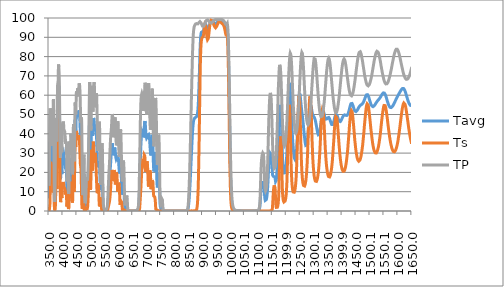
| Category | Tavg | Ts | TP |
|---|---|---|---|
| 349.97 | 6.508 | 0 | 13.017 |
| 350.48 | 7.138 | 0.281 | 13.996 |
| 350.99 | 8.348 | 0.704 | 15.993 |
| 351.5 | 11.121 | 1.271 | 20.971 |
| 352.01 | 15.952 | 1.981 | 29.922 |
| 352.52 | 21.013 | 2.339 | 39.686 |
| 353.02 | 25.55 | 3.533 | 47.568 |
| 353.53 | 28.588 | 5.73 | 51.445 |
| 354.03 | 31.69 | 10.231 | 53.149 |
| 354.53 | 34.672 | 16.026 | 53.319 |
| 355.03 | 37.337 | 21.53 | 53.144 |
| 355.53 | 38.534 | 24.613 | 52.455 |
| 356.03 | 38.877 | 25.484 | 52.27 |
| 356.52 | 38.861 | 25.096 | 52.626 |
| 357.01 | 38.297 | 24.131 | 52.464 |
| 357.51 | 37.366 | 23.074 | 51.659 |
| 358.0 | 36.44 | 22.473 | 50.407 |
| 358.49 | 36.015 | 22.051 | 49.979 |
| 358.97 | 35.868 | 21.639 | 50.097 |
| 359.46 | 35.305 | 21.469 | 49.14 |
| 360.06 | 34.316 | 21.231 | 47.402 |
| 360.55 | 33.411 | 20.657 | 46.166 |
| 361.03 | 32.139 | 18.641 | 45.638 |
| 361.5 | 30.64 | 16.918 | 44.363 |
| 361.98 | 28.518 | 16.063 | 40.974 |
| 362.46 | 25.698 | 14.973 | 36.422 |
| 363.05 | 23.272 | 12.804 | 33.741 |
| 363.52 | 22.8 | 10.703 | 34.896 |
| 363.98 | 24.614 | 9.629 | 39.599 |
| 364.45 | 28.708 | 10.771 | 46.645 |
| 365.03 | 35.099 | 15.515 | 54.682 |
| 365.49 | 38.7 | 19.523 | 57.877 |
| 365.95 | 40.673 | 23.02 | 58.326 |
| 366.53 | 37.827 | 24.28 | 51.374 |
| 366.98 | 32.644 | 22.482 | 42.805 |
| 367.55 | 23.535 | 17.049 | 30.021 |
| 368.0 | 15.774 | 11.325 | 20.223 |
| 368.45 | 9.382 | 6.094 | 12.67 |
| 369.01 | 4.67 | 2.235 | 7.105 |
| 369.46 | 3.136 | 0.983 | 5.289 |
| 370.01 | 2.611 | 0.494 | 4.729 |
| 370.45 | 3.063 | 0.416 | 5.71 |
| 371.0 | 4.799 | 0.5 | 9.098 |
| 371.55 | 7.767 | 0.708 | 14.826 |
| 371.98 | 11.037 | 1.046 | 21.027 |
| 372.52 | 15.996 | 2.142 | 29.85 |
| 372.95 | 20.868 | 3.953 | 37.784 |
| 373.49 | 26.051 | 7.657 | 44.446 |
| 374.02 | 30.572 | 12.899 | 48.244 |
| 374.45 | 33.033 | 17.435 | 48.63 |
| 374.98 | 34.636 | 22.276 | 46.995 |
| 375.51 | 35.04 | 25.512 | 44.568 |
| 376.03 | 34.054 | 25.836 | 42.272 |
| 376.45 | 32.212 | 24.401 | 40.023 |
| 376.97 | 28.771 | 20.393 | 37.15 |
| 377.49 | 26.297 | 16.509 | 36.085 |
| 378.01 | 25.082 | 12.85 | 37.315 |
| 378.52 | 26.862 | 11.456 | 42.268 |
| 379.04 | 31.488 | 13.143 | 49.832 |
| 379.55 | 38.29 | 18.842 | 57.738 |
| 379.96 | 43.447 | 24.793 | 62.102 |
| 380.47 | 48.479 | 31.792 | 65.165 |
| 380.97 | 50.638 | 36.034 | 65.242 |
| 381.48 | 50.559 | 36.362 | 64.756 |
| 381.98 | 49.795 | 34.659 | 64.932 |
| 382.49 | 51.043 | 34.611 | 67.474 |
| 382.99 | 54.492 | 37.959 | 71.025 |
| 383.49 | 59.359 | 44.237 | 74.482 |
| 383.99 | 63.072 | 50.211 | 75.934 |
| 384.49 | 64.781 | 53.875 | 75.688 |
| 384.99 | 64.628 | 54.685 | 74.571 |
| 385.49 | 63.221 | 53.453 | 72.99 |
| 385.99 | 61.23 | 50.685 | 71.775 |
| 386.49 | 58.222 | 47.448 | 68.995 |
| 386.99 | 54.426 | 43.436 | 65.415 |
| 387.49 | 49.053 | 38.412 | 59.693 |
| 387.99 | 42.751 | 32.78 | 52.721 |
| 388.48 | 36.399 | 26.929 | 45.869 |
| 388.98 | 30.156 | 21.098 | 39.213 |
| 389.48 | 24.708 | 15.742 | 33.674 |
| 389.98 | 20.244 | 10.985 | 29.503 |
| 390.49 | 17.511 | 7.511 | 27.51 |
| 390.99 | 16.471 | 5.385 | 27.556 |
| 391.49 | 17.283 | 4.591 | 29.976 |
| 392.0 | 19.792 | 5.303 | 34.28 |
| 392.5 | 23.035 | 7.026 | 39.044 |
| 393.01 | 25.983 | 9.446 | 42.521 |
| 393.51 | 27.441 | 11.484 | 43.398 |
| 394.02 | 26.772 | 12.354 | 41.19 |
| 394.54 | 24.255 | 11.539 | 36.97 |
| 395.05 | 21.097 | 9.524 | 32.671 |
| 395.46 | 19.127 | 7.798 | 30.456 |
| 395.97 | 18.718 | 6.777 | 30.659 |
| 396.49 | 20.389 | 7.366 | 33.413 |
| 397.01 | 23.42 | 9.457 | 37.383 |
| 397.53 | 26.696 | 11.852 | 41.54 |
| 397.95 | 28.683 | 13.584 | 43.782 |
| 398.48 | 30.106 | 14.869 | 45.343 |
| 399.01 | 30.251 | 14.861 | 45.64 |
| 399.54 | 30.055 | 14.618 | 45.492 |
| 399.96 | 30.076 | 14.3 | 45.852 |
| 400.5 | 30.494 | 14.638 | 46.35 |
| 401.04 | 30.859 | 15.026 | 46.692 |
| 401.47 | 30.737 | 15.01 | 46.463 |
| 402.01 | 29.947 | 14.688 | 45.206 |
| 402.45 | 28.903 | 13.759 | 44.046 |
| 402.99 | 27.509 | 12.69 | 42.328 |
| 403.54 | 27.003 | 12.182 | 41.824 |
| 403.99 | 27.001 | 12.16 | 41.841 |
| 404.54 | 27.313 | 12.404 | 42.221 |
| 404.99 | 27.502 | 12.643 | 42.361 |
| 405.55 | 27.157 | 12.442 | 41.873 |
| 406.0 | 26.679 | 12.167 | 41.19 |
| 406.45 | 25.993 | 11.589 | 40.396 |
| 407.02 | 25.31 | 11.157 | 39.464 |
| 407.48 | 24.861 | 10.815 | 38.908 |
| 408.05 | 24.204 | 10.383 | 38.025 |
| 408.51 | 23.577 | 9.924 | 37.23 |
| 408.97 | 22.618 | 9.19 | 36.046 |
| 409.55 | 21.588 | 8.477 | 34.699 |
| 410.02 | 21.372 | 8.537 | 34.207 |
| 410.49 | 21.787 | 8.92 | 34.653 |
| 410.96 | 22.36 | 9.341 | 35.38 |
| 411.55 | 22.659 | 9.385 | 35.932 |
| 412.03 | 21.864 | 8.682 | 35.045 |
| 412.5 | 19.845 | 7.229 | 32.462 |
| 412.98 | 16.875 | 5.405 | 28.345 |
| 413.46 | 13.44 | 3.547 | 23.333 |
| 413.94 | 10.506 | 2.301 | 18.712 |
| 414.55 | 8.702 | 2.042 | 15.361 |
| 415.04 | 9.065 | 2.787 | 15.343 |
| 415.52 | 11.103 | 4.16 | 18.046 |
| 416.01 | 13.82 | 5.439 | 22.202 |
| 416.5 | 16.264 | 6.399 | 26.128 |
| 417.0 | 17.646 | 6.801 | 28.491 |
| 417.49 | 17.426 | 6.32 | 28.531 |
| 417.99 | 15.387 | 5.033 | 25.742 |
| 418.48 | 12.122 | 3.141 | 21.104 |
| 418.98 | 8.652 | 1.726 | 15.578 |
| 419.48 | 6.04 | 1.026 | 11.054 |
| 419.98 | 4.81 | 0.849 | 8.772 |
| 420.49 | 4.874 | 1.054 | 8.695 |
| 420.99 | 6.35 | 1.837 | 10.864 |
| 421.5 | 9.339 | 3.484 | 15.194 |
| 422.0 | 13.427 | 5.794 | 21.059 |
| 422.51 | 17.84 | 8.077 | 27.603 |
| 423.02 | 21.115 | 9.665 | 32.565 |
| 423.53 | 23.081 | 10.673 | 35.489 |
| 424.04 | 23.196 | 10.334 | 36.058 |
| 424.55 | 21.393 | 8.944 | 33.842 |
| 425.06 | 19.125 | 7.389 | 30.86 |
| 425.45 | 17.902 | 6.78 | 29.023 |
| 425.96 | 18.204 | 7.577 | 28.832 |
| 426.48 | 20.36 | 9.659 | 31.061 |
| 426.99 | 23.318 | 12.091 | 34.545 |
| 427.51 | 25.948 | 14.058 | 37.838 |
| 428.03 | 27.493 | 15.136 | 39.85 |
| 428.54 | 27.563 | 15.001 | 40.124 |
| 429.06 | 26.138 | 13.664 | 38.611 |
| 429.45 | 24.42 | 12.165 | 36.674 |
| 429.97 | 21.975 | 10.119 | 33.831 |
| 430.49 | 19.954 | 8.602 | 31.306 |
| 431.01 | 18.46 | 7.583 | 29.338 |
| 431.52 | 17.193 | 6.777 | 27.609 |
| 432.04 | 15.881 | 6.007 | 25.754 |
| 432.56 | 14.417 | 5.269 | 23.566 |
| 432.95 | 13.335 | 4.758 | 21.912 |
| 433.47 | 12.192 | 4.345 | 20.04 |
| 433.99 | 11.666 | 4.34 | 18.992 |
| 434.51 | 12.405 | 5.312 | 19.499 |
| 435.03 | 15.021 | 7.736 | 22.305 |
| 435.55 | 19.763 | 12.086 | 27.441 |
| 435.94 | 24.21 | 16.176 | 32.245 |
| 436.46 | 29.903 | 21.263 | 38.544 |
| 436.97 | 33.982 | 24.842 | 43.122 |
| 437.49 | 35.636 | 26.281 | 44.991 |
| 438.01 | 34.151 | 24.661 | 43.642 |
| 438.52 | 29.853 | 20.436 | 39.269 |
| 439.04 | 24.227 | 15.142 | 33.312 |
| 439.55 | 19.689 | 11.252 | 28.125 |
| 439.94 | 17.887 | 9.991 | 25.783 |
| 440.45 | 18.289 | 10.744 | 25.833 |
| 440.96 | 21.544 | 13.905 | 29.182 |
| 441.48 | 27.016 | 19.04 | 34.992 |
| 441.99 | 33.68 | 25.215 | 42.144 |
| 442.5 | 40.116 | 31.254 | 48.978 |
| 443.0 | 44.874 | 35.865 | 53.882 |
| 443.51 | 47.363 | 38.493 | 56.232 |
| 444.02 | 47.32 | 38.503 | 56.137 |
| 444.52 | 45.301 | 36.698 | 53.904 |
| 445.03 | 42.904 | 34.44 | 51.369 |
| 445.53 | 41.645 | 33.226 | 50.063 |
| 446.03 | 42.4 | 33.812 | 50.987 |
| 446.53 | 44.687 | 35.793 | 53.581 |
| 447.03 | 47.624 | 38.133 | 57.115 |
| 447.52 | 50.162 | 40.172 | 60.151 |
| 448.02 | 51.757 | 41.483 | 62.032 |
| 448.51 | 52.067 | 41.596 | 62.537 |
| 449.0 | 51.364 | 40.979 | 61.749 |
| 449.49 | 50.057 | 39.78 | 60.333 |
| 449.98 | 49.083 | 38.875 | 59.29 |
| 450.47 | 48.584 | 38.16 | 59.008 |
| 450.96 | 48.764 | 37.966 | 59.561 |
| 451.56 | 49.637 | 37.974 | 61.299 |
| 452.04 | 50.334 | 37.983 | 62.685 |
| 452.52 | 50.799 | 37.939 | 63.659 |
| 453.0 | 50.852 | 37.759 | 63.945 |
| 453.48 | 50.516 | 37.572 | 63.459 |
| 453.95 | 50.182 | 37.675 | 62.689 |
| 454.54 | 49.767 | 37.93 | 61.605 |
| 455.01 | 49.773 | 38.327 | 61.219 |
| 455.48 | 50.177 | 38.818 | 61.537 |
| 456.06 | 50.901 | 39.281 | 62.522 |
| 456.52 | 51.52 | 39.39 | 63.65 |
| 456.99 | 51.981 | 39.24 | 64.721 |
| 457.45 | 52.223 | 38.841 | 65.605 |
| 458.02 | 52.072 | 37.996 | 66.148 |
| 458.47 | 51.638 | 37.065 | 66.212 |
| 459.04 | 50.581 | 35.486 | 65.675 |
| 459.49 | 49.499 | 33.998 | 64.999 |
| 460.05 | 47.822 | 31.828 | 63.817 |
| 460.5 | 46.271 | 29.992 | 62.549 |
| 460.95 | 44.429 | 28.115 | 60.744 |
| 461.5 | 41.974 | 25.918 | 58.031 |
| 462.05 | 39.599 | 24.41 | 54.789 |
| 462.49 | 37.924 | 23.821 | 52.028 |
| 463.04 | 36.122 | 23.405 | 48.838 |
| 463.47 | 34.999 | 23.056 | 46.941 |
| 464.01 | 33.99 | 22.291 | 45.688 |
| 464.55 | 33.356 | 20.695 | 46.018 |
| 464.98 | 32.933 | 18.827 | 47.04 |
| 465.51 | 32.087 | 15.75 | 48.423 |
| 466.04 | 30.357 | 11.941 | 48.773 |
| 466.47 | 28.254 | 8.771 | 47.737 |
| 466.99 | 25.015 | 5.374 | 44.656 |
| 467.52 | 21.25 | 3.138 | 39.363 |
| 468.04 | 17.303 | 1.926 | 32.681 |
| 468.46 | 14.205 | 1.479 | 26.931 |
| 468.97 | 10.594 | 1.116 | 20.072 |
| 469.49 | 7.833 | 1.056 | 14.61 |
| 470.0 | 6.146 | 1.251 | 11.041 |
| 470.52 | 5.508 | 1.94 | 9.076 |
| 471.03 | 5.637 | 3.053 | 8.221 |
| 471.54 | 6.375 | 4.314 | 8.435 |
| 472.04 | 7.581 | 5.285 | 9.877 |
| 472.55 | 9.354 | 5.894 | 12.814 |
| 473.05 | 11.742 | 6.172 | 17.313 |
| 473.46 | 13.693 | 5.973 | 21.414 |
| 473.96 | 15.456 | 5.219 | 25.693 |
| 474.46 | 16.088 | 3.69 | 28.486 |
| 474.96 | 15.62 | 2.039 | 29.201 |
| 475.46 | 14.529 | 0.946 | 28.113 |
| 475.96 | 12.499 | 0.429 | 24.569 |
| 476.46 | 9.758 | 0.289 | 19.228 |
| 477.05 | 6.364 | 0.212 | 12.516 |
| 477.55 | 4.247 | 0.186 | 8.308 |
| 478.05 | 2.984 | 0.161 | 5.808 |
| 478.54 | 2.374 | 0.173 | 4.575 |
| 479.04 | 2.11 | 0.184 | 4.036 |
| 479.54 | 2.06 | 0.208 | 3.911 |
| 480.03 | 2.186 | 0.27 | 4.102 |
| 480.53 | 2.478 | 0.354 | 4.602 |
| 481.03 | 3.001 | 0.51 | 5.492 |
| 481.53 | 3.799 | 0.751 | 6.847 |
| 482.03 | 4.803 | 0.991 | 8.614 |
| 482.52 | 5.981 | 1.253 | 10.708 |
| 483.03 | 7.239 | 1.514 | 12.964 |
| 483.53 | 8.32 | 1.664 | 14.976 |
| 484.03 | 9.16 | 1.705 | 16.615 |
| 484.53 | 9.641 | 1.69 | 17.592 |
| 485.04 | 9.794 | 1.578 | 18.009 |
| 485.55 | 9.572 | 1.408 | 17.736 |
| 486.05 | 9.143 | 1.25 | 17.035 |
| 486.46 | 8.843 | 1.223 | 16.464 |
| 486.97 | 8.641 | 1.313 | 15.968 |
| 487.49 | 8.725 | 1.555 | 15.895 |
| 488.0 | 9.248 | 2.052 | 16.444 |
| 488.52 | 10.24 | 2.859 | 17.62 |
| 489.04 | 11.679 | 4.081 | 19.277 |
| 489.45 | 13.161 | 5.353 | 20.969 |
| 489.97 | 15.298 | 7.154 | 23.442 |
| 490.5 | 17.752 | 9.209 | 26.295 |
| 491.03 | 20.389 | 11.388 | 29.39 |
| 491.45 | 22.742 | 13.281 | 32.203 |
| 491.98 | 26.007 | 15.896 | 36.118 |
| 492.52 | 29.795 | 19.033 | 40.557 |
| 493.05 | 34.212 | 22.561 | 45.862 |
| 493.49 | 37.838 | 25.139 | 50.537 |
| 494.03 | 42.038 | 27.592 | 56.485 |
| 494.46 | 44.764 | 28.762 | 60.765 |
| 495.01 | 46.915 | 28.948 | 64.881 |
| 495.45 | 47.42 | 27.995 | 66.845 |
| 496.0 | 46.247 | 25.44 | 67.054 |
| 496.56 | 43.06 | 21.334 | 64.786 |
| 497.0 | 39.505 | 17.659 | 61.351 |
| 497.45 | 35.693 | 14.281 | 57.104 |
| 498.01 | 31.409 | 11.562 | 51.256 |
| 498.46 | 28.935 | 10.877 | 46.993 |
| 499.03 | 27.52 | 11.808 | 43.231 |
| 499.49 | 27.859 | 13.938 | 41.78 |
| 499.95 | 29.543 | 17.233 | 41.853 |
| 500.52 | 33.25 | 22.235 | 44.265 |
| 500.98 | 36.549 | 25.749 | 47.349 |
| 501.45 | 39.889 | 28.676 | 51.101 |
| 502.03 | 43.689 | 31.084 | 56.294 |
| 502.5 | 45.835 | 31.728 | 59.942 |
| 502.97 | 46.968 | 31.069 | 62.867 |
| 503.56 | 46.704 | 28.58 | 64.828 |
| 504.03 | 45.161 | 25.545 | 64.776 |
| 504.51 | 43.057 | 22.63 | 63.485 |
| 504.99 | 41 | 20.921 | 61.079 |
| 505.47 | 39.517 | 20.869 | 58.164 |
| 505.95 | 38.885 | 22.596 | 55.173 |
| 506.55 | 39.304 | 26.086 | 52.522 |
| 507.04 | 40.412 | 29.326 | 51.498 |
| 507.53 | 41.978 | 32.276 | 51.68 |
| 508.02 | 43.795 | 34.67 | 52.921 |
| 508.51 | 45.541 | 35.948 | 55.134 |
| 509.0 | 47.05 | 36.199 | 57.9 |
| 509.49 | 48.173 | 35.484 | 60.863 |
| 509.99 | 48.534 | 33.488 | 63.58 |
| 510.48 | 48.236 | 30.877 | 65.596 |
| 510.98 | 47.426 | 28.123 | 66.729 |
| 511.48 | 46.487 | 26.148 | 66.825 |
| 511.98 | 45.511 | 25.162 | 65.861 |
| 512.48 | 44.662 | 25.215 | 64.109 |
| 512.99 | 43.877 | 26.025 | 61.73 |
| 513.49 | 43.192 | 27.155 | 59.23 |
| 514.0 | 42.629 | 28.414 | 56.845 |
| 514.5 | 42.192 | 29.405 | 54.979 |
| 515.01 | 41.896 | 30.046 | 53.746 |
| 515.52 | 41.713 | 30.16 | 53.266 |
| 516.03 | 41.643 | 29.739 | 53.546 |
| 516.54 | 41.559 | 28.709 | 54.408 |
| 517.05 | 41.459 | 27.225 | 55.694 |
| 517.56 | 41.336 | 25.394 | 57.278 |
| 517.95 | 41.22 | 23.893 | 58.547 |
| 518.46 | 40.951 | 21.913 | 59.989 |
| 518.97 | 40.452 | 19.852 | 61.051 |
| 519.49 | 39.61 | 17.869 | 61.352 |
| 520.0 | 38.411 | 15.977 | 60.845 |
| 520.52 | 36.762 | 14.118 | 59.405 |
| 521.04 | 34.716 | 12.43 | 57.001 |
| 521.55 | 32.398 | 10.935 | 53.86 |
| 521.94 | 30.596 | 10.011 | 51.182 |
| 522.46 | 28.316 | 9.213 | 47.418 |
| 522.98 | 26.135 | 8.874 | 43.395 |
| 523.49 | 24.414 | 9.122 | 39.707 |
| 524.01 | 23.255 | 10.012 | 36.498 |
| 524.53 | 22.657 | 11.386 | 33.929 |
| 525.05 | 22.411 | 12.714 | 32.108 |
| 525.56 | 22.438 | 13.727 | 31.149 |
| 525.95 | 22.593 | 14.173 | 31.014 |
| 526.47 | 22.946 | 14.335 | 31.556 |
| 526.98 | 23.536 | 13.992 | 33.079 |
| 527.5 | 24.264 | 12.969 | 35.559 |
| 528.02 | 24.845 | 11.188 | 38.502 |
| 528.53 | 25.209 | 8.762 | 41.655 |
| 529.05 | 25.406 | 6.346 | 44.466 |
| 529.56 | 25.272 | 4.258 | 46.287 |
| 529.95 | 24.978 | 3.211 | 46.744 |
| 530.46 | 24.273 | 2.336 | 46.21 |
| 530.98 | 22.93 | 1.928 | 43.933 |
| 531.49 | 21.124 | 1.859 | 40.389 |
| 532.0 | 18.968 | 2.228 | 35.708 |
| 532.51 | 16.887 | 3.171 | 30.602 |
| 533.02 | 15.048 | 4.481 | 25.615 |
| 533.53 | 13.496 | 5.634 | 21.359 |
| 534.04 | 12.194 | 6.377 | 18.012 |
| 534.54 | 11.303 | 6.884 | 15.722 |
| 535.05 | 10.74 | 7.18 | 14.301 |
| 535.55 | 10.451 | 7.292 | 13.609 |
| 536.05 | 10.289 | 6.944 | 13.633 |
| 536.56 | 10.297 | 6.15 | 14.445 |
| 537.06 | 10.356 | 4.548 | 16.163 |
| 537.56 | 10.863 | 2.705 | 19.021 |
| 538.05 | 12.164 | 1.26 | 23.068 |
| 538.55 | 14.014 | 0.523 | 27.506 |
| 539.04 | 15.909 | 0.298 | 31.519 |
| 539.54 | 17.153 | 0.196 | 34.111 |
| 540.03 | 17.61 | 0.139 | 35.08 |
| 540.52 | 17.33 | 0.102 | 34.558 |
| 541.01 | 16.157 | 0.074 | 32.239 |
| 541.49 | 14.364 | 0.056 | 28.672 |
| 541.98 | 11.755 | 0.047 | 23.463 |
| 542.46 | 8.892 | 0.046 | 17.738 |
| 543.06 | 5.561 | 0.037 | 11.085 |
| 543.54 | 3.707 | 0.037 | 7.376 |
| 544.02 | 2.506 | 0.065 | 4.946 |
| 544.5 | 1.75 | 0.028 | 3.472 |
| 544.97 | 1.307 | 0.046 | 2.567 |
| 545.56 | 0.964 | 0.037 | 1.891 |
| 546.03 | 0.771 | 0.037 | 1.505 |
| 546.5 | 0.659 | 0.065 | 1.252 |
| 546.97 | 0.549 | 0.028 | 1.07 |
| 547.55 | 0.467 | 0.037 | 0.896 |
| 548.01 | 0.422 | 0.037 | 0.807 |
| 548.47 | 0.37 | 0.009 | 0.73 |
| 549.04 | 0.338 | 0.019 | 0.657 |
| 549.5 | 0.313 | 0.009 | 0.617 |
| 549.95 | 0.297 | 0.019 | 0.575 |
| 550.51 | 0.29 | 0.028 | 0.552 |
| 550.96 | 0.298 | 0.056 | 0.54 |
| 551.52 | 0.28 | 0.009 | 0.551 |
| 551.97 | 0.284 | 0.028 | 0.54 |
| 552.52 | 0.296 | 0.046 | 0.546 |
| 552.96 | 0.31 | 0.047 | 0.574 |
| 553.51 | 0.314 | 0.037 | 0.592 |
| 553.95 | 0.324 | 0.028 | 0.621 |
| 554.49 | 0.365 | 0.047 | 0.684 |
| 555.03 | 0.402 | 0.056 | 0.747 |
| 555.46 | 0.42 | 0.028 | 0.811 |
| 556.0 | 0.495 | 0.056 | 0.934 |
| 556.53 | 0.571 | 0.065 | 1.076 |
| 556.96 | 0.663 | 0.065 | 1.26 |
| 557.48 | 0.809 | 0.103 | 1.516 |
| 558.01 | 1.012 | 0.14 | 1.883 |
| 558.53 | 1.279 | 0.178 | 2.381 |
| 558.95 | 1.577 | 0.262 | 2.891 |
| 559.47 | 2.079 | 0.403 | 3.756 |
| 559.99 | 2.7 | 0.599 | 4.801 |
| 560.5 | 3.487 | 0.854 | 6.121 |
| 561.02 | 4.444 | 1.174 | 7.715 |
| 561.53 | 5.463 | 1.503 | 9.424 |
| 562.04 | 6.607 | 1.889 | 11.326 |
| 562.55 | 7.728 | 2.271 | 13.185 |
| 563.05 | 8.848 | 2.641 | 15.054 |
| 563.46 | 9.696 | 2.943 | 16.449 |
| 563.96 | 10.687 | 3.281 | 18.093 |
| 564.46 | 11.605 | 3.587 | 19.624 |
| 564.96 | 12.441 | 3.899 | 20.982 |
| 565.46 | 13.241 | 4.165 | 22.318 |
| 565.96 | 14.042 | 4.517 | 23.567 |
| 566.46 | 14.929 | 4.971 | 24.888 |
| 567.05 | 16.128 | 5.584 | 26.671 |
| 567.55 | 17.224 | 6.184 | 28.264 |
| 568.04 | 18.442 | 6.904 | 29.981 |
| 568.54 | 19.714 | 7.677 | 31.751 |
| 569.03 | 21.048 | 8.553 | 33.543 |
| 569.53 | 22.29 | 9.448 | 35.133 |
| 570.02 | 23.53 | 10.521 | 36.54 |
| 570.51 | 24.695 | 11.618 | 37.773 |
| 571.01 | 25.884 | 12.897 | 38.87 |
| 571.5 | 26.992 | 14.222 | 39.762 |
| 572.0 | 28.132 | 15.652 | 40.612 |
| 572.49 | 29.287 | 17.149 | 41.424 |
| 572.99 | 30.454 | 18.562 | 42.346 |
| 573.48 | 31.602 | 19.758 | 43.446 |
| 573.98 | 32.668 | 20.659 | 44.678 |
| 574.48 | 33.593 | 21.21 | 45.976 |
| 574.98 | 34.381 | 21.406 | 47.356 |
| 575.48 | 34.876 | 21.148 | 48.603 |
| 575.98 | 35.084 | 20.593 | 49.575 |
| 576.48 | 34.96 | 19.678 | 50.242 |
| 576.99 | 34.414 | 18.532 | 50.295 |
| 577.49 | 33.592 | 17.358 | 49.825 |
| 578.0 | 32.558 | 16.328 | 48.788 |
| 578.51 | 31.449 | 15.627 | 47.27 |
| 579.02 | 30.39 | 15.349 | 45.431 |
| 579.53 | 29.528 | 15.573 | 43.483 |
| 580.05 | 28.858 | 16.196 | 41.521 |
| 580.46 | 28.566 | 16.959 | 40.173 |
| 580.98 | 28.5 | 18.094 | 38.905 |
| 581.5 | 28.745 | 19.303 | 38.187 |
| 582.03 | 29.188 | 20.266 | 38.11 |
| 582.55 | 29.907 | 21.087 | 38.727 |
| 582.97 | 30.517 | 21.394 | 39.641 |
| 583.5 | 31.343 | 21.448 | 41.237 |
| 584.04 | 32.099 | 21.084 | 43.114 |
| 584.46 | 32.562 | 20.461 | 44.663 |
| 585.0 | 32.896 | 19.343 | 46.449 |
| 585.54 | 32.917 | 17.971 | 47.864 |
| 585.98 | 32.646 | 16.756 | 48.535 |
| 586.52 | 32.026 | 15.337 | 48.716 |
| 586.96 | 31.357 | 14.417 | 48.296 |
| 587.51 | 30.415 | 13.725 | 47.106 |
| 587.95 | 29.621 | 13.648 | 45.594 |
| 588.51 | 28.717 | 14.065 | 43.369 |
| 588.95 | 28.075 | 14.836 | 41.313 |
| 589.52 | 27.463 | 16.159 | 38.768 |
| 589.97 | 27.088 | 17.303 | 36.873 |
| 590.53 | 26.807 | 18.625 | 34.989 |
| 590.99 | 26.684 | 19.373 | 33.995 |
| 591.56 | 26.726 | 19.902 | 33.549 |
| 592.02 | 26.892 | 20.003 | 33.78 |
| 592.48 | 27.138 | 19.709 | 34.566 |
| 593.06 | 27.547 | 18.832 | 36.263 |
| 593.52 | 27.853 | 17.612 | 38.094 |
| 593.99 | 28.112 | 16.111 | 40.112 |
| 594.46 | 28.261 | 14.348 | 42.175 |
| 595.05 | 28.312 | 12.195 | 44.429 |
| 595.52 | 28.286 | 10.756 | 45.816 |
| 596.0 | 28.283 | 9.989 | 46.576 |
| 596.47 | 28.271 | 9.885 | 46.657 |
| 596.95 | 28.262 | 10.453 | 46.07 |
| 597.55 | 28.138 | 11.915 | 44.361 |
| 598.04 | 27.698 | 13.112 | 42.284 |
| 598.52 | 26.86 | 13.99 | 39.73 |
| 599.01 | 25.812 | 14.636 | 36.988 |
| 599.49 | 24.704 | 15.056 | 34.353 |
| 599.98 | 23.502 | 15.127 | 31.877 |
| 600.47 | 22.455 | 14.958 | 29.953 |
| 600.96 | 21.543 | 14.458 | 28.628 |
| 601.46 | 20.702 | 13.41 | 27.995 |
| 601.95 | 19.995 | 11.889 | 28.102 |
| 602.45 | 19.412 | 9.903 | 28.921 |
| 602.95 | 19.038 | 7.571 | 30.504 |
| 603.45 | 19.046 | 5.478 | 32.614 |
| 603.95 | 19.591 | 4.006 | 35.176 |
| 604.45 | 20.471 | 3.203 | 37.739 |
| 604.95 | 21.545 | 3.039 | 40.051 |
| 605.45 | 22.488 | 3.486 | 41.491 |
| 605.96 | 23.248 | 4.107 | 42.389 |
| 606.46 | 23.478 | 4.63 | 42.326 |
| 606.97 | 23.178 | 4.953 | 41.402 |
| 607.48 | 22.372 | 5.174 | 39.57 |
| 607.99 | 21.062 | 5.376 | 36.748 |
| 608.5 | 19.398 | 5.497 | 33.299 |
| 609.01 | 17.503 | 5.525 | 29.48 |
| 609.52 | 15.49 | 5.373 | 25.607 |
| 610.03 | 13.602 | 5.074 | 22.13 |
| 610.54 | 11.912 | 4.516 | 19.307 |
| 611.06 | 10.379 | 3.585 | 17.172 |
| 611.44 | 9.413 | 2.703 | 16.122 |
| 611.95 | 8.461 | 1.591 | 15.331 |
| 612.47 | 8.051 | 0.845 | 15.258 |
| 612.98 | 8.139 | 0.456 | 15.822 |
| 613.5 | 8.751 | 0.293 | 17.209 |
| 614.01 | 9.728 | 0.243 | 19.213 |
| 614.53 | 10.89 | 0.242 | 21.539 |
| 615.04 | 11.992 | 0.295 | 23.688 |
| 615.56 | 12.898 | 0.421 | 25.375 |
| 615.95 | 13.319 | 0.51 | 26.127 |
| 616.46 | 13.567 | 0.571 | 26.563 |
| 616.98 | 13.391 | 0.658 | 26.123 |
| 617.49 | 12.866 | 0.665 | 25.066 |
| 618.01 | 11.821 | 0.689 | 22.953 |
| 618.52 | 10.441 | 0.722 | 20.159 |
| 619.03 | 8.733 | 0.71 | 16.756 |
| 619.55 | 6.861 | 0.698 | 13.023 |
| 620.06 | 5.19 | 0.697 | 9.683 |
| 620.45 | 4.134 | 0.649 | 7.618 |
| 620.96 | 3.039 | 0.482 | 5.596 |
| 621.47 | 2.292 | 0.28 | 4.304 |
| 621.98 | 1.79 | 0.122 | 3.457 |
| 622.49 | 1.487 | 0.044 | 2.93 |
| 623.0 | 1.325 | 0.035 | 2.615 |
| 623.51 | 1.244 | 0.017 | 2.47 |
| 624.01 | 1.244 | 0.017 | 2.471 |
| 624.52 | 1.336 | 0.009 | 2.663 |
| 625.03 | 1.587 | 0.017 | 3.156 |
| 625.53 | 2.007 | 0 | 4.014 |
| 626.03 | 2.623 | 0 | 5.247 |
| 626.54 | 3.233 | 0.009 | 6.458 |
| 627.04 | 3.666 | 0.026 | 7.306 |
| 627.54 | 3.903 | 0 | 7.806 |
| 628.04 | 4.001 | 0 | 8.002 |
| 628.53 | 3.972 | 0.017 | 7.927 |
| 629.03 | 3.812 | 0.017 | 7.606 |
| 629.52 | 3.531 | 0.009 | 7.053 |
| 630.02 | 3.04 | 0 | 6.079 |
| 630.51 | 2.348 | 0 | 4.696 |
| 631.0 | 1.569 | 0 | 3.138 |
| 631.48 | 0.925 | 0 | 1.849 |
| 631.97 | 0.514 | 0 | 1.028 |
| 632.46 | 0.301 | 0 | 0.602 |
| 633.06 | 0.184 | 0.009 | 0.359 |
| 633.54 | 0.141 | 0.017 | 0.264 |
| 634.02 | 0.093 | 0.008 | 0.178 |
| 634.5 | 0.071 | 0 | 0.142 |
| 634.97 | 0.071 | 0.008 | 0.133 |
| 635.45 | 0.059 | 0.025 | 0.092 |
| 636.04 | 0.044 | 0 | 0.087 |
| 636.51 | 0.05 | 0.017 | 0.083 |
| 636.98 | 0.034 | 0.008 | 0.06 |
| 637.56 | 0.03 | 0 | 0.06 |
| 638.02 | 0.029 | 0.017 | 0.042 |
| 638.48 | 0.021 | 0 | 0.041 |
| 639.06 | 0.029 | 0.017 | 0.042 |
| 639.52 | 0.014 | 0 | 0.028 |
| 639.97 | 0.016 | 0 | 0.032 |
| 640.54 | 0.023 | 0.008 | 0.037 |
| 640.99 | 0.014 | 0 | 0.028 |
| 641.55 | 0.016 | 0 | 0.032 |
| 642.0 | 0.016 | 0 | 0.032 |
| 642.55 | 0.022 | 0.017 | 0.028 |
| 643.0 | 0.02 | 0.017 | 0.023 |
| 643.55 | 0.014 | 0 | 0.028 |
| 643.99 | 0.018 | 0.017 | 0.019 |
| 644.53 | 0.024 | 0.025 | 0.023 |
| 644.97 | 0.012 | 0 | 0.023 |
| 645.51 | 0.018 | 0.008 | 0.028 |
| 646.05 | 0.013 | 0.008 | 0.018 |
| 646.47 | 0.012 | 0 | 0.023 |
| 647.01 | 0.012 | 0 | 0.023 |
| 647.54 | 0.018 | 0.008 | 0.028 |
| 647.96 | 0.018 | 0.008 | 0.028 |
| 648.48 | 0.016 | 0 | 0.032 |
| 649.01 | 0.022 | 0.016 | 0.028 |
| 649.53 | 0.029 | 0.008 | 0.051 |
| 650.05 | 0.018 | 0 | 0.037 |
| 650.46 | 0.022 | 0.008 | 0.037 |
| 650.97 | 0.027 | 0.008 | 0.046 |
| 651.49 | 0.024 | 0.016 | 0.032 |
| 652.0 | 0.018 | 0 | 0.037 |
| 652.51 | 0.027 | 0.008 | 0.046 |
| 653.01 | 0.029 | 0.008 | 0.05 |
| 653.52 | 0.033 | 0.016 | 0.05 |
| 654.02 | 0.025 | 0 | 0.05 |
| 654.52 | 0.039 | 0 | 0.078 |
| 655.02 | 0.037 | 0 | 0.073 |
| 655.52 | 0.041 | 0 | 0.082 |
| 656.02 | 0.043 | 0.008 | 0.078 |
| 656.51 | 0.05 | 0.008 | 0.091 |
| 657.01 | 0.052 | 0 | 0.105 |
| 657.5 | 0.055 | 0 | 0.109 |
| 658.0 | 0.066 | 0 | 0.132 |
| 658.49 | 0.077 | 0.008 | 0.145 |
| 658.98 | 0.079 | 0 | 0.159 |
| 659.47 | 0.095 | 0.008 | 0.182 |
| 659.96 | 0.095 | 0 | 0.19 |
| 660.55 | 0.116 | 0.024 | 0.209 |
| 661.04 | 0.127 | 0.024 | 0.231 |
| 661.53 | 0.139 | 0.024 | 0.254 |
| 662.03 | 0.152 | 0.024 | 0.28 |
| 662.52 | 0.153 | 0.016 | 0.29 |
| 663.01 | 0.176 | 0.008 | 0.344 |
| 663.5 | 0.209 | 0.048 | 0.371 |
| 663.99 | 0.211 | 0.024 | 0.399 |
| 664.49 | 0.233 | 0.032 | 0.435 |
| 664.98 | 0.253 | 0.008 | 0.497 |
| 665.48 | 0.295 | 0.024 | 0.565 |
| 665.97 | 0.334 | 0.039 | 0.629 |
| 666.47 | 0.371 | 0.024 | 0.719 |
| 666.97 | 0.422 | 0.024 | 0.82 |
| 667.47 | 0.516 | 0.063 | 0.968 |
| 667.97 | 0.586 | 0.039 | 1.133 |
| 668.47 | 0.715 | 0.063 | 1.367 |
| 668.98 | 0.872 | 0.063 | 1.68 |
| 669.48 | 1.081 | 0.071 | 2.09 |
| 669.99 | 1.347 | 0.063 | 2.63 |
| 670.5 | 1.753 | 0.095 | 3.411 |
| 671.01 | 2.301 | 0.111 | 4.49 |
| 671.53 | 3.037 | 0.134 | 5.94 |
| 672.05 | 4.092 | 0.206 | 7.977 |
| 672.46 | 5.142 | 0.269 | 10.015 |
| 672.98 | 6.789 | 0.38 | 13.198 |
| 673.5 | 8.88 | 0.61 | 17.15 |
| 674.03 | 11.174 | 0.985 | 21.363 |
| 674.45 | 13.319 | 1.475 | 25.163 |
| 674.98 | 16.032 | 2.359 | 29.705 |
| 675.52 | 18.893 | 3.441 | 34.345 |
| 676.05 | 21.787 | 4.715 | 38.859 |
| 676.48 | 23.995 | 5.729 | 42.261 |
| 677.02 | 26.637 | 7.018 | 46.257 |
| 677.46 | 28.581 | 8.051 | 49.11 |
| 678.0 | 30.79 | 9.35 | 52.23 |
| 678.55 | 32.802 | 10.75 | 54.853 |
| 678.99 | 34.228 | 11.973 | 56.483 |
| 679.54 | 35.758 | 13.559 | 57.957 |
| 679.99 | 36.82 | 14.874 | 58.767 |
| 680.55 | 38.015 | 16.522 | 59.508 |
| 681.0 | 38.904 | 17.791 | 60.016 |
| 681.45 | 39.672 | 18.973 | 60.371 |
| 682.01 | 40.558 | 20.346 | 60.769 |
| 682.47 | 41.184 | 21.435 | 60.933 |
| 683.04 | 41.792 | 22.659 | 60.925 |
| 683.5 | 42.087 | 23.514 | 60.661 |
| 683.96 | 42.237 | 24.269 | 60.206 |
| 684.54 | 42.136 | 25.002 | 59.27 |
| 685.01 | 41.778 | 25.234 | 58.322 |
| 685.47 | 41.231 | 25.285 | 57.178 |
| 686.06 | 40.313 | 24.99 | 55.637 |
| 686.53 | 39.506 | 24.604 | 54.409 |
| 687.01 | 38.769 | 24.218 | 53.32 |
| 687.48 | 38.174 | 23.942 | 52.406 |
| 687.96 | 37.949 | 24.025 | 51.872 |
| 688.56 | 38.181 | 24.658 | 51.705 |
| 689.04 | 38.754 | 25.535 | 51.973 |
| 689.52 | 39.652 | 26.576 | 52.729 |
| 690.0 | 40.762 | 27.586 | 53.937 |
| 690.49 | 41.923 | 28.409 | 55.436 |
| 690.98 | 43.126 | 29.031 | 57.221 |
| 691.46 | 44.248 | 29.388 | 59.109 |
| 691.96 | 45.224 | 29.406 | 61.042 |
| 692.45 | 46.06 | 29.245 | 62.876 |
| 693.06 | 46.577 | 28.46 | 64.694 |
| 693.56 | 46.602 | 27.44 | 65.764 |
| 694.05 | 46.278 | 26.106 | 66.449 |
| 694.55 | 45.491 | 24.486 | 66.497 |
| 695.05 | 44.506 | 22.825 | 66.186 |
| 695.55 | 43.311 | 21.349 | 65.273 |
| 696.05 | 42.021 | 20.208 | 63.833 |
| 696.55 | 40.894 | 19.698 | 62.09 |
| 697.06 | 39.938 | 19.852 | 60.024 |
| 697.56 | 39.214 | 20.58 | 57.847 |
| 697.94 | 38.797 | 21.411 | 56.183 |
| 698.44 | 38.361 | 22.627 | 54.094 |
| 698.95 | 38.016 | 23.747 | 52.285 |
| 699.46 | 37.744 | 24.64 | 50.849 |
| 699.97 | 37.55 | 25.246 | 49.855 |
| 700.48 | 37.544 | 25.648 | 49.44 |
| 700.98 | 37.635 | 25.767 | 49.502 |
| 701.49 | 37.824 | 25.512 | 50.137 |
| 702.01 | 38.102 | 24.921 | 51.283 |
| 702.52 | 38.428 | 24.004 | 52.852 |
| 703.03 | 38.757 | 22.727 | 54.787 |
| 703.54 | 38.998 | 21.004 | 56.993 |
| 704.05 | 39.127 | 19.017 | 59.237 |
| 704.56 | 39.179 | 16.902 | 61.455 |
| 704.95 | 39.118 | 15.272 | 62.964 |
| 705.46 | 39.118 | 13.648 | 64.589 |
| 705.97 | 39.185 | 12.641 | 65.728 |
| 706.49 | 39.343 | 12.419 | 66.266 |
| 707.0 | 39.56 | 13.005 | 66.116 |
| 707.51 | 39.81 | 14.202 | 65.418 |
| 708.02 | 39.927 | 15.816 | 64.039 |
| 708.54 | 39.719 | 17.361 | 62.076 |
| 709.05 | 39.14 | 18.735 | 59.544 |
| 709.56 | 38.287 | 19.841 | 56.734 |
| 709.94 | 37.495 | 20.432 | 54.558 |
| 710.45 | 36.314 | 21.025 | 51.604 |
| 710.96 | 35.126 | 21.426 | 48.826 |
| 711.47 | 33.912 | 21.476 | 46.347 |
| 711.98 | 32.839 | 21.291 | 44.386 |
| 712.49 | 31.83 | 20.712 | 42.948 |
| 713.0 | 30.944 | 19.793 | 42.095 |
| 713.5 | 30.096 | 18.313 | 41.879 |
| 714.01 | 29.424 | 16.531 | 42.317 |
| 714.52 | 28.957 | 14.501 | 43.413 |
| 715.02 | 28.793 | 12.534 | 45.052 |
| 715.52 | 29.247 | 11.295 | 47.199 |
| 716.03 | 30.436 | 11.036 | 49.836 |
| 716.53 | 32.282 | 11.791 | 52.774 |
| 717.03 | 34.296 | 12.887 | 55.705 |
| 717.52 | 36.175 | 13.876 | 58.474 |
| 718.02 | 37.689 | 14.646 | 60.731 |
| 718.52 | 38.794 | 15.193 | 62.395 |
| 719.01 | 39.525 | 15.627 | 63.423 |
| 719.51 | 39.795 | 15.96 | 63.629 |
| 720.0 | 39.573 | 16.129 | 63.016 |
| 720.49 | 38.812 | 16.14 | 61.484 |
| 720.98 | 37.636 | 15.966 | 59.306 |
| 721.46 | 35.97 | 15.462 | 56.478 |
| 721.95 | 33.969 | 14.78 | 53.157 |
| 722.56 | 30.99 | 13.432 | 48.548 |
| 723.04 | 28.483 | 11.968 | 44.997 |
| 723.52 | 26.032 | 10.422 | 41.641 |
| 724.0 | 23.969 | 9.134 | 38.804 |
| 724.47 | 22.395 | 8.346 | 36.444 |
| 724.95 | 21.248 | 7.763 | 34.732 |
| 725.54 | 20.49 | 7.463 | 33.517 |
| 726.01 | 20.319 | 7.377 | 33.261 |
| 726.48 | 20.512 | 7.354 | 33.67 |
| 726.95 | 21.07 | 7.427 | 34.713 |
| 727.53 | 22.165 | 7.405 | 36.925 |
| 728.0 | 23.395 | 7.378 | 39.413 |
| 728.46 | 24.782 | 7.225 | 42.339 |
| 729.03 | 26.698 | 7 | 46.395 |
| 729.49 | 28.205 | 6.669 | 49.742 |
| 730.06 | 29.809 | 6.195 | 53.424 |
| 730.51 | 30.619 | 5.418 | 55.821 |
| 730.96 | 30.922 | 4.358 | 57.486 |
| 731.52 | 30.678 | 2.782 | 58.574 |
| 731.97 | 30.222 | 1.699 | 58.745 |
| 732.52 | 29.45 | 0.969 | 57.932 |
| 732.97 | 28.56 | 0.748 | 56.372 |
| 733.52 | 27.085 | 0.66 | 53.51 |
| 733.96 | 25.621 | 0.62 | 50.622 |
| 734.5 | 23.435 | 0.597 | 46.274 |
| 735.04 | 21.033 | 0.565 | 41.502 |
| 735.47 | 19.109 | 0.574 | 37.643 |
| 736.01 | 16.885 | 0.55 | 33.219 |
| 736.55 | 14.954 | 0.551 | 29.357 |
| 736.97 | 13.779 | 0.567 | 26.991 |
| 737.5 | 12.748 | 0.562 | 24.935 |
| 738.03 | 12.195 | 0.538 | 23.851 |
| 738.55 | 12.18 | 0.522 | 23.838 |
| 738.97 | 12.509 | 0.482 | 24.536 |
| 739.49 | 13.453 | 0.408 | 26.499 |
| 740.01 | 14.863 | 0.309 | 29.417 |
| 740.52 | 16.406 | 0.176 | 32.636 |
| 741.03 | 17.938 | 0.059 | 35.817 |
| 741.54 | 19.079 | 0.042 | 38.117 |
| 742.05 | 19.766 | 0.034 | 39.498 |
| 742.46 | 19.951 | 0.025 | 39.877 |
| 742.96 | 19.926 | 0.025 | 39.827 |
| 743.47 | 19.427 | 0.034 | 38.819 |
| 743.97 | 18.651 | 0.034 | 37.268 |
| 744.47 | 17.321 | 0.017 | 34.625 |
| 744.96 | 15.656 | 0 | 31.313 |
| 745.46 | 13.587 | 0.026 | 27.148 |
| 745.96 | 11.113 | 0.009 | 22.217 |
| 746.55 | 8.087 | 0 | 16.173 |
| 747.04 | 5.97 | 0.026 | 11.914 |
| 747.53 | 4.332 | 0 | 8.664 |
| 748.02 | 3.205 | 0 | 6.409 |
| 748.51 | 2.534 | 0 | 5.067 |
| 749.0 | 2.09 | 0 | 4.18 |
| 749.49 | 1.829 | 0.009 | 3.649 |
| 749.98 | 1.712 | 0.009 | 3.415 |
| 750.47 | 1.752 | 0.009 | 3.496 |
| 751.05 | 2.098 | 0.018 | 4.179 |
| 751.54 | 2.587 | 0 | 5.175 |
| 752.03 | 3.106 | 0.045 | 6.167 |
| 752.51 | 3.403 | 0 | 6.805 |
| 753.0 | 3.576 | 0.027 | 7.125 |
| 753.49 | 3.633 | 0 | 7.265 |
| 753.98 | 3.669 | 0.018 | 7.319 |
| 754.47 | 3.614 | 0.018 | 7.209 |
| 754.96 | 3.463 | 0 | 6.926 |
| 755.55 | 3.201 | 0 | 6.402 |
| 756.04 | 2.894 | 0 | 5.789 |
| 756.53 | 2.416 | 0 | 4.832 |
| 757.03 | 1.774 | 0.019 | 3.53 |
| 757.52 | 1.097 | 0.009 | 2.184 |
| 758.02 | 0.561 | 0 | 1.121 |
| 758.52 | 0.273 | 0 | 0.546 |
| 759.02 | 0.146 | 0 | 0.292 |
| 759.52 | 0.09 | 0.009 | 0.17 |
| 760.02 | 0.07 | 0.008 | 0.132 |
| 760.53 | 0.049 | 0.008 | 0.091 |
| 761.04 | 0.037 | 0 | 0.074 |
| 761.55 | 0.042 | 0.025 | 0.06 |
| 761.95 | 0.035 | 0.017 | 0.053 |
| 762.47 | 0.036 | 0.025 | 0.046 |
| 762.98 | 0.03 | 0.017 | 0.043 |
| 763.5 | 0.022 | 0.008 | 0.036 |
| 764.02 | 0.023 | 0.017 | 0.029 |
| 764.55 | 0.019 | 0.017 | 0.022 |
| 764.97 | 0.019 | 0.017 | 0.022 |
| 765.49 | 0.022 | 0.025 | 0.018 |
| 766.02 | 0.02 | 0.017 | 0.022 |
| 766.45 | 0.012 | 0.008 | 0.015 |
| 766.98 | 0.011 | 0 | 0.023 |
| 767.52 | 0.024 | 0.025 | 0.023 |
| 767.95 | 0.02 | 0.017 | 0.023 |
| 768.5 | 0.016 | 0.008 | 0.023 |
| 769.04 | 0.02 | 0.017 | 0.023 |
| 769.48 | 0.018 | 0.017 | 0.019 |
| 770.03 | 0.012 | 0.008 | 0.016 |
| 770.48 | 0.01 | 0.008 | 0.012 |
| 771.03 | 0.008 | 0 | 0.016 |
| 771.48 | 0.016 | 0.008 | 0.024 |
| 772.04 | 0.025 | 0.025 | 0.024 |
| 772.49 | 0.01 | 0.008 | 0.012 |
| 772.95 | 0.017 | 0.017 | 0.016 |
| 773.52 | 0.017 | 0.017 | 0.016 |
| 773.97 | 0.008 | 0 | 0.016 |
| 774.55 | 0.023 | 0.034 | 0.012 |
| 775.01 | 0.008 | 0.008 | 0.008 |
| 775.47 | 0.008 | 0.008 | 0.008 |
| 776.05 | 0.015 | 0.008 | 0.021 |
| 776.52 | 0.013 | 0.017 | 0.008 |
| 776.99 | 0.013 | 0.008 | 0.017 |
| 777.46 | 0.015 | 0.017 | 0.013 |
| 778.05 | 0.006 | 0.008 | 0.004 |
| 778.53 | 0.006 | 0 | 0.013 |
| 779.01 | 0.009 | 0 | 0.017 |
| 779.49 | 0.006 | 0.009 | 0.004 |
| 779.97 | 0.013 | 0.009 | 0.017 |
| 780.45 | 0.011 | 0.009 | 0.013 |
| 781.05 | 0.006 | 0 | 0.013 |
| 781.54 | 0.021 | 0.025 | 0.017 |
| 782.02 | 0.004 | 0 | 0.009 |
| 782.51 | 0.021 | 0.026 | 0.017 |
| 783.0 | 0.007 | 0 | 0.013 |
| 783.49 | 0.019 | 0.026 | 0.013 |
| 783.99 | 0.009 | 0.017 | 0 |
| 784.48 | 0.015 | 0.017 | 0.013 |
| 784.97 | 0.013 | 0.017 | 0.009 |
| 785.47 | 0.022 | 0.026 | 0.018 |
| 785.97 | 0.028 | 0.043 | 0.013 |
| 786.47 | 0.015 | 0.017 | 0.013 |
| 786.97 | 0.013 | 0.017 | 0.009 |
| 787.47 | 0.013 | 0.009 | 0.018 |
| 787.97 | 0.013 | 0.009 | 0.018 |
| 788.47 | 0.022 | 0.026 | 0.018 |
| 788.97 | 0.007 | 0 | 0.013 |
| 789.48 | 0.011 | 0.017 | 0.004 |
| 789.98 | 0.019 | 0.034 | 0.005 |
| 790.49 | 0.015 | 0.026 | 0.005 |
| 791.0 | 0.013 | 0.026 | 0 |
| 791.5 | 0.018 | 0.017 | 0.018 |
| 792.01 | 0.011 | 0.009 | 0.014 |
| 792.52 | 0.011 | 0.017 | 0.005 |
| 793.03 | 0.009 | 0.009 | 0.009 |
| 793.53 | 0.018 | 0.017 | 0.018 |
| 794.04 | 0.022 | 0.026 | 0.018 |
| 794.55 | 0.015 | 0.017 | 0.014 |
| 795.06 | 0.02 | 0.026 | 0.014 |
| 795.44 | 0.009 | 0.009 | 0.009 |
| 795.95 | 0.016 | 0.009 | 0.023 |
| 796.46 | 0.009 | 0 | 0.018 |
| 796.97 | 0.018 | 0.017 | 0.018 |
| 797.48 | 0.013 | 0.017 | 0.009 |
| 797.99 | 0.018 | 0.017 | 0.018 |
| 798.5 | 0.022 | 0.034 | 0.009 |
| 799.01 | 0.009 | 0.009 | 0.009 |
| 799.52 | 0.016 | 0.017 | 0.014 |
| 800.03 | 0.018 | 0.026 | 0.009 |
| 800.54 | 0.016 | 0.009 | 0.023 |
| 801.04 | 0.022 | 0.026 | 0.019 |
| 801.55 | 0.014 | 0.009 | 0.019 |
| 802.05 | 0.007 | 0 | 0.014 |
| 802.56 | 0.027 | 0.034 | 0.019 |
| 803.06 | 0.013 | 0.017 | 0.009 |
| 803.44 | 0.007 | 0 | 0.014 |
| 803.95 | 0.009 | 0.009 | 0.009 |
| 804.45 | 0.022 | 0.026 | 0.019 |
| 804.95 | 0.009 | 0 | 0.019 |
| 805.45 | 0.014 | 0.009 | 0.019 |
| 805.95 | 0.024 | 0.034 | 0.014 |
| 806.45 | 0.011 | 0.017 | 0.005 |
| 806.94 | 0.014 | 0.009 | 0.019 |
| 807.56 | 0.011 | 0.009 | 0.014 |
| 808.06 | 0.02 | 0.026 | 0.014 |
| 808.55 | 0.005 | 0 | 0.009 |
| 809.04 | 0.018 | 0.017 | 0.019 |
| 809.53 | 0.011 | 0.009 | 0.014 |
| 810.02 | 0.018 | 0.017 | 0.019 |
| 810.51 | 0.007 | 0.009 | 0.005 |
| 811.0 | 0.018 | 0.017 | 0.019 |
| 811.48 | 0.026 | 0.043 | 0.01 |
| 811.96 | 0.025 | 0.026 | 0.024 |
| 812.56 | 0.011 | 0.017 | 0.005 |
| 813.04 | 0.023 | 0.026 | 0.019 |
| 813.52 | 0.027 | 0.035 | 0.019 |
| 814.0 | 0.011 | 0.017 | 0.005 |
| 814.47 | 0.019 | 0.009 | 0.029 |
| 815.06 | 0.005 | 0 | 0.01 |
| 815.53 | 0.018 | 0.017 | 0.019 |
| 816.0 | 0.018 | 0.026 | 0.01 |
| 816.46 | 0.027 | 0.026 | 0.029 |
| 817.05 | 0.012 | 0.009 | 0.014 |
| 817.51 | 0.009 | 0.009 | 0.01 |
| 817.97 | 0.019 | 0.009 | 0.029 |
| 818.54 | 0.018 | 0.017 | 0.019 |
| 819.0 | 0.016 | 0.009 | 0.024 |
| 819.45 | 0.005 | 0 | 0.01 |
| 820.02 | 0.014 | 0.009 | 0.019 |
| 820.47 | 0.023 | 0.026 | 0.019 |
| 821.03 | 0.015 | 0 | 0.029 |
| 821.47 | 0.025 | 0.026 | 0.024 |
| 822.03 | 0.009 | 0.009 | 0.01 |
| 822.47 | 0.009 | 0.009 | 0.01 |
| 823.02 | 0.02 | 0.026 | 0.015 |
| 823.45 | 0.016 | 0.017 | 0.015 |
| 824.0 | 0.028 | 0.026 | 0.029 |
| 824.54 | 0.012 | 0.009 | 0.015 |
| 824.97 | 0.019 | 0.017 | 0.02 |
| 825.5 | 0.032 | 0.044 | 0.02 |
| 826.03 | 0.016 | 0.018 | 0.015 |
| 826.46 | 0.012 | 0.009 | 0.015 |
| 826.99 | 0.027 | 0.035 | 0.02 |
| 827.51 | 0.017 | 0 | 0.034 |
| 828.03 | 0.025 | 0.035 | 0.015 |
| 828.55 | 0.021 | 0.018 | 0.025 |
| 828.97 | 0.016 | 0.018 | 0.015 |
| 829.48 | 0.024 | 0.018 | 0.03 |
| 830.0 | 0.031 | 0.026 | 0.035 |
| 830.51 | 0.031 | 0.026 | 0.035 |
| 831.01 | 0.026 | 0.026 | 0.025 |
| 831.52 | 0.028 | 0.027 | 0.03 |
| 832.02 | 0.03 | 0.035 | 0.025 |
| 832.53 | 0.028 | 0.027 | 0.03 |
| 833.03 | 0.024 | 0.018 | 0.03 |
| 833.52 | 0.021 | 0.018 | 0.025 |
| 834.02 | 0.024 | 0.009 | 0.04 |
| 834.52 | 0.025 | 0.009 | 0.04 |
| 835.01 | 0.028 | 0.027 | 0.03 |
| 835.5 | 0.034 | 0.027 | 0.04 |
| 835.99 | 0.039 | 0.018 | 0.06 |
| 836.48 | 0.039 | 0.027 | 0.05 |
| 836.97 | 0.039 | 0.027 | 0.051 |
| 837.46 | 0.039 | 0.027 | 0.05 |
| 838.04 | 0.039 | 0.018 | 0.061 |
| 838.53 | 0.055 | 0.045 | 0.066 |
| 839.01 | 0.045 | 0.018 | 0.071 |
| 839.5 | 0.049 | 0.036 | 0.061 |
| 839.98 | 0.052 | 0.018 | 0.087 |
| 840.46 | 0.06 | 0.027 | 0.092 |
| 841.04 | 0.074 | 0.036 | 0.112 |
| 841.53 | 0.07 | 0.018 | 0.123 |
| 842.01 | 0.085 | 0.027 | 0.143 |
| 842.49 | 0.096 | 0.018 | 0.174 |
| 842.98 | 0.116 | 0.027 | 0.205 |
| 843.46 | 0.138 | 0.018 | 0.257 |
| 844.04 | 0.164 | 0.009 | 0.319 |
| 844.53 | 0.207 | 0.018 | 0.397 |
| 845.02 | 0.264 | 0.037 | 0.491 |
| 845.5 | 0.329 | 0.037 | 0.621 |
| 845.99 | 0.418 | 0.037 | 0.798 |
| 846.48 | 0.535 | 0.037 | 1.033 |
| 846.97 | 0.697 | 0.037 | 1.357 |
| 847.46 | 0.895 | 0.018 | 1.771 |
| 847.96 | 1.186 | 0.028 | 2.345 |
| 848.55 | 1.59 | 0 | 3.18 |
| 849.05 | 2.082 | 0.046 | 4.117 |
| 849.55 | 2.659 | 0.028 | 5.291 |
| 850.05 | 3.319 | 0.046 | 6.592 |
| 850.55 | 4.069 | 0.056 | 8.082 |
| 850.96 | 4.753 | 0.028 | 9.479 |
| 851.46 | 5.65 | 0.009 | 11.291 |
| 851.97 | 6.633 | 0.056 | 13.209 |
| 852.48 | 7.69 | 0.037 | 15.343 |
| 852.99 | 8.791 | 0.028 | 17.554 |
| 853.51 | 9.992 | 0.028 | 19.956 |
| 854.03 | 11.285 | 0.038 | 22.533 |
| 854.55 | 12.609 | 0.019 | 25.198 |
| 854.97 | 13.726 | 0.028 | 27.424 |
| 855.49 | 15.176 | 0.019 | 30.334 |
| 856.02 | 16.724 | 0.019 | 33.428 |
| 856.55 | 18.388 | 0.047 | 36.729 |
| 856.98 | 19.717 | 0.047 | 39.387 |
| 857.51 | 21.388 | 0.048 | 42.728 |
| 858.05 | 23.103 | 0.038 | 46.167 |
| 858.48 | 24.496 | 0.048 | 48.945 |
| 859.03 | 26.265 | 0.038 | 52.493 |
| 859.46 | 27.705 | 0.057 | 55.352 |
| 860.01 | 29.446 | 0.029 | 58.862 |
| 860.45 | 30.862 | 0.077 | 61.648 |
| 861.01 | 32.535 | 0.048 | 65.021 |
| 861.45 | 33.89 | 0.058 | 67.723 |
| 862.01 | 35.529 | 0.077 | 70.981 |
| 862.46 | 36.81 | 0.048 | 73.573 |
| 863.02 | 38.399 | 0.077 | 76.72 |
| 863.48 | 39.536 | 0.048 | 79.023 |
| 864.05 | 40.96 | 0.048 | 81.872 |
| 864.51 | 41.967 | 0.058 | 83.877 |
| 864.97 | 42.928 | 0.058 | 85.797 |
| 865.54 | 43.999 | 0.087 | 87.91 |
| 866.01 | 44.689 | 0.039 | 89.34 |
| 866.47 | 45.361 | 0.068 | 90.655 |
| 867.06 | 46.045 | 0.058 | 92.032 |
| 867.53 | 46.499 | 0.068 | 92.93 |
| 868.0 | 46.867 | 0.059 | 93.675 |
| 868.47 | 47.164 | 0.069 | 94.26 |
| 868.95 | 47.427 | 0.088 | 94.766 |
| 869.54 | 47.634 | 0.069 | 95.199 |
| 870.02 | 47.801 | 0.088 | 95.513 |
| 870.5 | 47.889 | 0.059 | 95.718 |
| 870.98 | 47.999 | 0.069 | 95.93 |
| 871.47 | 48.104 | 0.079 | 96.13 |
| 871.95 | 48.175 | 0.118 | 96.232 |
| 872.56 | 48.237 | 0.089 | 96.384 |
| 873.05 | 48.311 | 0.109 | 96.513 |
| 873.54 | 48.359 | 0.079 | 96.639 |
| 874.03 | 48.43 | 0.119 | 96.742 |
| 874.52 | 48.514 | 0.139 | 96.89 |
| 875.01 | 48.561 | 0.169 | 96.953 |
| 875.5 | 48.589 | 0.169 | 97.009 |
| 876.0 | 48.644 | 0.229 | 97.058 |
| 876.5 | 48.688 | 0.26 | 97.116 |
| 876.99 | 48.719 | 0.31 | 97.128 |
| 877.49 | 48.784 | 0.4 | 97.168 |
| 877.99 | 48.844 | 0.511 | 97.177 |
| 878.49 | 48.914 | 0.702 | 97.126 |
| 878.99 | 49.023 | 0.934 | 97.111 |
| 879.49 | 49.156 | 1.286 | 97.026 |
| 880.0 | 49.352 | 1.693 | 97.011 |
| 880.5 | 49.599 | 2.2 | 96.997 |
| 881.0 | 49.891 | 2.848 | 96.935 |
| 881.51 | 50.321 | 3.667 | 96.976 |
| 882.01 | 50.809 | 4.686 | 96.931 |
| 882.52 | 51.405 | 5.874 | 96.936 |
| 883.02 | 52.128 | 7.288 | 96.968 |
| 883.53 | 53.027 | 9.057 | 96.996 |
| 884.03 | 54.073 | 11.074 | 97.072 |
| 884.54 | 55.324 | 13.479 | 97.169 |
| 885.04 | 56.741 | 16.24 | 97.242 |
| 885.55 | 58.375 | 19.447 | 97.304 |
| 886.06 | 60.264 | 23.104 | 97.424 |
| 886.56 | 62.35 | 27.218 | 97.482 |
| 886.94 | 64.003 | 30.399 | 97.606 |
| 887.45 | 66.342 | 35.013 | 97.672 |
| 887.95 | 68.821 | 39.815 | 97.827 |
| 888.46 | 71.403 | 44.878 | 97.928 |
| 888.97 | 73.943 | 49.868 | 98.019 |
| 889.47 | 76.491 | 54.884 | 98.098 |
| 889.97 | 78.944 | 59.783 | 98.105 |
| 890.48 | 81.29 | 64.428 | 98.152 |
| 890.98 | 83.497 | 68.862 | 98.132 |
| 891.48 | 85.413 | 72.675 | 98.151 |
| 891.99 | 87.128 | 76.201 | 98.054 |
| 892.49 | 88.582 | 79.138 | 98.026 |
| 892.99 | 89.771 | 81.618 | 97.924 |
| 893.49 | 90.662 | 83.505 | 97.819 |
| 893.99 | 91.413 | 85.115 | 97.71 |
| 894.48 | 91.941 | 86.346 | 97.536 |
| 894.98 | 92.339 | 87.305 | 97.373 |
| 895.48 | 92.556 | 87.951 | 97.161 |
| 895.97 | 92.769 | 88.532 | 97.005 |
| 896.46 | 92.819 | 88.848 | 96.79 |
| 896.96 | 92.921 | 89.177 | 96.666 |
| 897.45 | 92.966 | 89.466 | 96.466 |
| 898.06 | 93 | 89.723 | 96.277 |
| 898.55 | 92.956 | 89.842 | 96.07 |
| 899.03 | 92.971 | 89.943 | 95.999 |
| 899.52 | 92.882 | 89.928 | 95.836 |
| 900.0 | 92.836 | 89.925 | 95.748 |
| 900.48 | 92.822 | 89.972 | 95.672 |
| 900.96 | 92.817 | 90.011 | 95.624 |
| 901.56 | 92.874 | 90.151 | 95.598 |
| 902.04 | 92.949 | 90.319 | 95.58 |
| 902.51 | 93.117 | 90.641 | 95.594 |
| 902.99 | 93.299 | 90.934 | 95.663 |
| 903.46 | 93.53 | 91.329 | 95.731 |
| 904.05 | 93.897 | 91.99 | 95.805 |
| 904.51 | 94.236 | 92.561 | 95.912 |
| 904.98 | 94.59 | 93.155 | 96.025 |
| 905.45 | 94.947 | 93.759 | 96.134 |
| 906.02 | 95.417 | 94.535 | 96.299 |
| 906.48 | 95.782 | 95.09 | 96.474 |
| 907.06 | 96.23 | 95.816 | 96.643 |
| 907.51 | 96.579 | 96.294 | 96.864 |
| 907.97 | 96.791 | 96.585 | 96.998 |
| 908.53 | 97.025 | 96.84 | 97.21 |
| 908.98 | 97.199 | 97.051 | 97.346 |
| 909.54 | 97.293 | 97.037 | 97.549 |
| 909.99 | 97.306 | 96.858 | 97.754 |
| 910.54 | 97.231 | 96.533 | 97.928 |
| 910.98 | 97.088 | 96.159 | 98.018 |
| 911.53 | 96.887 | 95.621 | 98.152 |
| 911.97 | 96.717 | 95.116 | 98.319 |
| 912.51 | 96.427 | 94.388 | 98.465 |
| 913.05 | 96.105 | 93.605 | 98.606 |
| 913.48 | 95.809 | 92.954 | 98.665 |
| 914.02 | 95.474 | 92.175 | 98.774 |
| 914.55 | 95.168 | 91.48 | 98.857 |
| 914.97 | 94.915 | 90.896 | 98.934 |
| 915.5 | 94.576 | 90.208 | 98.943 |
| 916.02 | 94.345 | 89.694 | 98.995 |
| 916.54 | 94.13 | 89.264 | 98.997 |
| 916.96 | 93.992 | 88.977 | 99.007 |
| 917.48 | 93.842 | 88.72 | 98.964 |
| 917.99 | 93.8 | 88.594 | 99.006 |
| 918.5 | 93.767 | 88.592 | 98.941 |
| 919.01 | 93.829 | 88.736 | 98.922 |
| 919.52 | 93.875 | 88.941 | 98.81 |
| 920.02 | 94.015 | 89.303 | 98.727 |
| 920.53 | 94.161 | 89.628 | 98.695 |
| 921.03 | 94.332 | 90.081 | 98.584 |
| 921.53 | 94.582 | 90.659 | 98.505 |
| 922.02 | 94.798 | 91.188 | 98.408 |
| 922.52 | 95.069 | 91.826 | 98.312 |
| 923.01 | 95.323 | 92.413 | 98.233 |
| 923.5 | 95.619 | 93.135 | 98.102 |
| 923.99 | 95.905 | 93.785 | 98.024 |
| 924.48 | 96.127 | 94.357 | 97.897 |
| 924.96 | 96.423 | 94.992 | 97.855 |
| 925.55 | 96.73 | 95.73 | 97.73 |
| 926.03 | 96.933 | 96.203 | 97.663 |
| 926.51 | 97.152 | 96.712 | 97.592 |
| 927.0 | 97.336 | 97.153 | 97.52 |
| 927.48 | 97.54 | 97.619 | 97.46 |
| 927.96 | 97.692 | 97.948 | 97.436 |
| 928.53 | 97.827 | 98.252 | 97.402 |
| 929.01 | 97.932 | 98.482 | 97.382 |
| 929.49 | 98.008 | 98.689 | 97.328 |
| 929.97 | 98.093 | 98.855 | 97.331 |
| 930.55 | 98.118 | 98.886 | 97.351 |
| 931.03 | 98.176 | 99.002 | 97.35 |
| 931.5 | 98.205 | 98.991 | 97.419 |
| 931.98 | 98.189 | 98.95 | 97.428 |
| 932.46 | 98.208 | 98.919 | 97.498 |
| 933.04 | 98.192 | 98.849 | 97.535 |
| 933.52 | 98.217 | 98.839 | 97.596 |
| 934.0 | 98.153 | 98.658 | 97.647 |
| 934.49 | 98.118 | 98.489 | 97.746 |
| 934.97 | 98.123 | 98.392 | 97.854 |
| 935.55 | 98.105 | 98.276 | 97.934 |
| 936.04 | 98.048 | 98.097 | 97.999 |
| 936.53 | 98.02 | 97.921 | 98.119 |
| 937.01 | 97.975 | 97.71 | 98.239 |
| 937.51 | 97.891 | 97.53 | 98.251 |
| 938.0 | 97.876 | 97.374 | 98.377 |
| 938.49 | 97.775 | 97.107 | 98.444 |
| 938.99 | 97.794 | 97.023 | 98.565 |
| 939.48 | 97.682 | 96.769 | 98.596 |
| 939.98 | 97.635 | 96.606 | 98.664 |
| 940.49 | 97.59 | 96.404 | 98.777 |
| 940.99 | 97.515 | 96.164 | 98.867 |
| 941.5 | 97.45 | 96.018 | 98.883 |
| 942.01 | 97.382 | 95.814 | 98.949 |
| 942.52 | 97.326 | 95.648 | 99.004 |
| 943.03 | 97.286 | 95.502 | 99.071 |
| 943.55 | 97.2 | 95.333 | 99.068 |
| 943.96 | 97.188 | 95.253 | 99.123 |
| 944.48 | 97.156 | 95.166 | 99.146 |
| 945.0 | 97.134 | 95.08 | 99.189 |
| 945.53 | 97.106 | 94.999 | 99.213 |
| 945.95 | 97.141 | 95.031 | 99.251 |
| 946.48 | 97.081 | 94.919 | 99.243 |
| 947.02 | 97.097 | 94.955 | 99.239 |
| 947.55 | 97.121 | 95.027 | 99.214 |
| 947.98 | 97.142 | 95.029 | 99.254 |
| 948.53 | 97.189 | 95.129 | 99.249 |
| 948.96 | 97.23 | 95.213 | 99.248 |
| 949.51 | 97.311 | 95.381 | 99.242 |
| 949.95 | 97.339 | 95.427 | 99.252 |
| 950.5 | 97.455 | 95.654 | 99.256 |
| 950.95 | 97.5 | 95.775 | 99.224 |
| 951.5 | 97.584 | 95.966 | 99.202 |
| 951.95 | 97.693 | 96.164 | 99.221 |
| 952.51 | 97.787 | 96.382 | 99.192 |
| 952.97 | 97.855 | 96.523 | 99.186 |
| 953.53 | 97.979 | 96.79 | 99.168 |
| 953.99 | 98.031 | 96.884 | 99.178 |
| 954.45 | 98.11 | 97.041 | 99.18 |
| 955.03 | 98.194 | 97.24 | 99.148 |
| 955.49 | 98.32 | 97.483 | 99.156 |
| 955.95 | 98.367 | 97.554 | 99.18 |
| 956.53 | 98.416 | 97.687 | 99.145 |
| 957.0 | 98.456 | 97.768 | 99.145 |
| 957.47 | 98.498 | 97.848 | 99.148 |
| 958.06 | 98.566 | 97.963 | 99.169 |
| 958.54 | 98.624 | 98.061 | 99.188 |
| 959.01 | 98.64 | 98.1 | 99.181 |
| 959.49 | 98.628 | 98.099 | 99.158 |
| 959.97 | 98.657 | 98.114 | 99.201 |
| 960.45 | 98.634 | 98.064 | 99.203 |
| 961.05 | 98.602 | 98.052 | 99.151 |
| 961.53 | 98.626 | 98.06 | 99.193 |
| 962.02 | 98.653 | 98.109 | 99.197 |
| 962.5 | 98.606 | 98.013 | 99.199 |
| 962.99 | 98.544 | 97.901 | 99.186 |
| 963.48 | 98.556 | 97.874 | 99.238 |
| 963.97 | 98.532 | 97.838 | 99.226 |
| 964.46 | 98.526 | 97.812 | 99.24 |
| 964.95 | 98.458 | 97.709 | 99.208 |
| 965.56 | 98.466 | 97.645 | 99.286 |
| 966.06 | 98.416 | 97.595 | 99.238 |
| 966.55 | 98.403 | 97.562 | 99.244 |
| 967.05 | 98.369 | 97.495 | 99.243 |
| 967.55 | 98.316 | 97.417 | 99.214 |
| 968.04 | 98.335 | 97.405 | 99.265 |
| 968.54 | 98.214 | 97.246 | 99.183 |
| 969.04 | 98.235 | 97.253 | 99.217 |
| 969.54 | 98.202 | 97.193 | 99.211 |
| 970.04 | 98.159 | 97.14 | 99.178 |
| 970.54 | 98.168 | 97.174 | 99.161 |
| 971.04 | 98.033 | 96.966 | 99.1 |
| 971.54 | 98.029 | 96.994 | 99.064 |
| 972.05 | 97.996 | 96.951 | 99.04 |
| 972.55 | 97.912 | 96.818 | 99.006 |
| 973.05 | 97.888 | 96.827 | 98.95 |
| 973.55 | 97.789 | 96.673 | 98.905 |
| 974.05 | 97.715 | 96.565 | 98.866 |
| 974.56 | 97.581 | 96.438 | 98.725 |
| 975.06 | 97.499 | 96.281 | 98.717 |
| 975.56 | 97.4 | 96.162 | 98.637 |
| 976.06 | 97.247 | 95.984 | 98.511 |
| 976.44 | 97.133 | 95.879 | 98.387 |
| 976.94 | 96.948 | 95.565 | 98.331 |
| 977.44 | 96.813 | 95.411 | 98.214 |
| 977.95 | 96.598 | 95.132 | 98.064 |
| 978.45 | 96.399 | 94.842 | 97.957 |
| 978.95 | 96.181 | 94.547 | 97.814 |
| 979.45 | 95.954 | 94.233 | 97.674 |
| 979.95 | 95.7 | 93.896 | 97.504 |
| 980.44 | 95.448 | 93.536 | 97.36 |
| 980.94 | 95.182 | 93.169 | 97.194 |
| 981.56 | 94.875 | 92.711 | 97.039 |
| 982.06 | 94.64 | 92.354 | 96.925 |
| 982.55 | 94.405 | 91.991 | 96.819 |
| 983.05 | 94.227 | 91.746 | 96.708 |
| 983.54 | 94.018 | 91.438 | 96.599 |
| 984.03 | 93.917 | 91.271 | 96.564 |
| 984.52 | 93.784 | 91.071 | 96.497 |
| 985.01 | 93.731 | 90.961 | 96.5 |
| 985.5 | 93.713 | 90.932 | 96.493 |
| 985.99 | 93.812 | 91.034 | 96.59 |
| 986.48 | 93.926 | 91.211 | 96.641 |
| 986.96 | 94.069 | 91.386 | 96.753 |
| 987.56 | 94.387 | 91.828 | 96.946 |
| 988.05 | 94.601 | 92.137 | 97.066 |
| 988.53 | 94.802 | 92.43 | 97.174 |
| 989.0 | 94.88 | 92.534 | 97.227 |
| 989.48 | 94.825 | 92.393 | 97.258 |
| 990.01 | 91.932 | 88.255 | 95.609 |
| 990.51 | 90.309 | 85.998 | 94.621 |
| 991.02 | 88.58 | 83.73 | 93.43 |
| 991.52 | 86.193 | 80.616 | 91.77 |
| 992.03 | 83.574 | 77.227 | 89.92 |
| 992.53 | 80.562 | 73.512 | 87.612 |
| 993.03 | 77.342 | 69.609 | 85.076 |
| 993.53 | 73.747 | 65.288 | 82.206 |
| 994.04 | 69.99 | 60.927 | 79.053 |
| 994.54 | 65.759 | 56.05 | 75.469 |
| 995.04 | 61.454 | 51.201 | 71.707 |
| 995.54 | 56.889 | 46.105 | 67.672 |
| 996.04 | 52.361 | 41.091 | 63.63 |
| 996.53 | 47.543 | 35.987 | 59.098 |
| 997.03 | 42.933 | 31.168 | 54.698 |
| 997.53 | 38.392 | 26.653 | 50.13 |
| 998.02 | 34.124 | 22.519 | 45.728 |
| 998.52 | 30.02 | 18.714 | 41.327 |
| 999.01 | 26.301 | 15.429 | 37.172 |
| 999.51 | 22.801 | 12.512 | 33.09 |
| 1000.0 | 19.738 | 10.133 | 29.343 |
| 1000.49 | 16.976 | 8.14 | 25.811 |
| 1000.98 | 14.629 | 6.499 | 22.759 |
| 1001.47 | 12.476 | 5.145 | 19.807 |
| 1001.96 | 10.686 | 4.162 | 17.21 |
| 1002.45 | 9.095 | 3.33 | 14.861 |
| 1002.94 | 7.762 | 2.696 | 12.828 |
| 1003.43 | 6.664 | 2.207 | 11.121 |
| 1003.92 | 5.699 | 1.813 | 9.585 |
| 1004.4 | 4.887 | 1.503 | 8.272 |
| 1004.89 | 4.213 | 1.26 | 7.167 |
| 1005.61 | 3.39 | 0.98 | 5.8 |
| 1006.09 | 2.927 | 0.821 | 5.033 |
| 1006.58 | 2.563 | 0.717 | 4.409 |
| 1007.06 | 2.218 | 0.611 | 3.825 |
| 1007.54 | 1.96 | 0.536 | 3.384 |
| 1008.02 | 1.701 | 0.461 | 2.941 |
| 1008.5 | 1.507 | 0.409 | 2.605 |
| 1008.97 | 1.332 | 0.364 | 2.3 |
| 1009.45 | 1.189 | 0.327 | 2.051 |
| 1009.92 | 1.058 | 0.29 | 1.827 |
| 1010.4 | 0.955 | 0.274 | 1.636 |
| 1011.11 | 0.813 | 0.238 | 1.389 |
| 1011.58 | 0.742 | 0.223 | 1.262 |
| 1012.05 | 0.672 | 0.207 | 1.137 |
| 1012.52 | 0.613 | 0.193 | 1.032 |
| 1012.99 | 0.557 | 0.178 | 0.935 |
| 1013.46 | 0.512 | 0.171 | 0.853 |
| 1013.93 | 0.469 | 0.156 | 0.783 |
| 1014.4 | 0.435 | 0.156 | 0.714 |
| 1015.09 | 0.382 | 0.134 | 0.631 |
| 1015.56 | 0.358 | 0.133 | 0.582 |
| 1016.02 | 0.334 | 0.119 | 0.549 |
| 1016.48 | 0.31 | 0.126 | 0.494 |
| 1016.95 | 0.296 | 0.119 | 0.473 |
| 1017.41 | 0.272 | 0.111 | 0.432 |
| 1018.1 | 0.251 | 0.111 | 0.391 |
| 1018.55 | 0.237 | 0.104 | 0.37 |
| 1019.01 | 0.223 | 0.097 | 0.35 |
| 1019.47 | 0.21 | 0.096 | 0.323 |
| 1019.92 | 0.203 | 0.096 | 0.31 |
| 1020.6 | 0.189 | 0.089 | 0.289 |
| 1021.06 | 0.179 | 0.089 | 0.269 |
| 1021.51 | 0.169 | 0.082 | 0.255 |
| 1021.96 | 0.162 | 0.081 | 0.242 |
| 1022.41 | 0.155 | 0.081 | 0.228 |
| 1023.08 | 0.151 | 0.081 | 0.221 |
| 1023.53 | 0.144 | 0.074 | 0.214 |
| 1023.98 | 0.131 | 0.067 | 0.194 |
| 1024.42 | 0.134 | 0.074 | 0.194 |
| 1025.09 | 0.127 | 0.067 | 0.187 |
| 1025.53 | 0.12 | 0.067 | 0.174 |
| 1025.97 | 0.12 | 0.073 | 0.168 |
| 1026.42 | 0.113 | 0.066 | 0.161 |
| 1027.08 | 0.11 | 0.066 | 0.154 |
| 1027.52 | 0.107 | 0.066 | 0.147 |
| 1027.95 | 0.097 | 0.053 | 0.141 |
| 1028.61 | 0.1 | 0.059 | 0.14 |
| 1029.04 | 0.093 | 0.059 | 0.128 |
| 1029.48 | 0.093 | 0.052 | 0.133 |
| 1029.91 | 0.09 | 0.059 | 0.121 |
| 1030.56 | 0.086 | 0.052 | 0.12 |
| 1031.0 | 0.083 | 0.052 | 0.114 |
| 1031.43 | 0.08 | 0.045 | 0.114 |
| 1032.07 | 0.079 | 0.051 | 0.107 |
| 1032.5 | 0.079 | 0.051 | 0.107 |
| 1032.93 | 0.079 | 0.051 | 0.107 |
| 1033.57 | 0.073 | 0.045 | 0.1 |
| 1033.99 | 0.073 | 0.051 | 0.094 |
| 1034.42 | 0.066 | 0.044 | 0.088 |
| 1035.06 | 0.072 | 0.051 | 0.093 |
| 1035.48 | 0.063 | 0.038 | 0.087 |
| 1035.9 | 0.069 | 0.044 | 0.093 |
| 1036.53 | 0.063 | 0.044 | 0.081 |
| 1036.95 | 0.059 | 0.038 | 0.081 |
| 1037.58 | 0.062 | 0.044 | 0.081 |
| 1038.0 | 0.062 | 0.044 | 0.08 |
| 1038.42 | 0.056 | 0.037 | 0.074 |
| 1039.04 | 0.056 | 0.037 | 0.074 |
| 1039.46 | 0.052 | 0.031 | 0.074 |
| 1040.08 | 0.058 | 0.037 | 0.079 |
| 1040.49 | 0.049 | 0.031 | 0.068 |
| 1040.91 | 0.049 | 0.031 | 0.068 |
| 1041.53 | 0.052 | 0.037 | 0.067 |
| 1041.94 | 0.052 | 0.03 | 0.073 |
| 1042.55 | 0.052 | 0.036 | 0.067 |
| 1042.96 | 0.051 | 0.03 | 0.072 |
| 1043.58 | 0.049 | 0.036 | 0.061 |
| 1043.99 | 0.048 | 0.03 | 0.066 |
| 1044.6 | 0.042 | 0.024 | 0.061 |
| 1045.01 | 0.048 | 0.036 | 0.06 |
| 1045.41 | 0.045 | 0.03 | 0.06 |
| 1046.02 | 0.045 | 0.03 | 0.06 |
| 1046.43 | 0.045 | 0.03 | 0.06 |
| 1047.03 | 0.044 | 0.024 | 0.065 |
| 1047.44 | 0.044 | 0.03 | 0.059 |
| 1048.04 | 0.042 | 0.029 | 0.054 |
| 1048.44 | 0.044 | 0.029 | 0.059 |
| 1049.05 | 0.038 | 0.023 | 0.053 |
| 1049.45 | 0.041 | 0.029 | 0.053 |
| 1050.05 | 0.035 | 0.023 | 0.048 |
| 1050.45 | 0.038 | 0.023 | 0.053 |
| 1051.05 | 0.038 | 0.023 | 0.053 |
| 1051.45 | 0.043 | 0.029 | 0.058 |
| 1052.05 | 0.038 | 0.023 | 0.052 |
| 1052.45 | 0.04 | 0.029 | 0.052 |
| 1053.04 | 0.037 | 0.023 | 0.052 |
| 1053.44 | 0.035 | 0.029 | 0.042 |
| 1054.04 | 0.037 | 0.023 | 0.052 |
| 1054.44 | 0.035 | 0.023 | 0.046 |
| 1055.03 | 0.034 | 0.023 | 0.046 |
| 1055.43 | 0.037 | 0.023 | 0.051 |
| 1056.02 | 0.034 | 0.022 | 0.046 |
| 1056.42 | 0.034 | 0.023 | 0.046 |
| 1057.01 | 0.034 | 0.022 | 0.046 |
| 1057.41 | 0.039 | 0.028 | 0.051 |
| 1058.0 | 0.031 | 0.017 | 0.045 |
| 1058.6 | 0.036 | 0.022 | 0.05 |
| 1058.99 | 0.036 | 0.022 | 0.05 |
| 1059.58 | 0.033 | 0.017 | 0.05 |
| 1059.98 | 0.033 | 0.022 | 0.045 |
| 1060.57 | 0.033 | 0.022 | 0.045 |
| 1060.97 | 0.036 | 0.022 | 0.049 |
| 1061.56 | 0.033 | 0.022 | 0.044 |
| 1061.95 | 0.035 | 0.022 | 0.049 |
| 1062.55 | 0.03 | 0.016 | 0.044 |
| 1062.94 | 0.038 | 0.022 | 0.054 |
| 1063.54 | 0.035 | 0.022 | 0.049 |
| 1063.93 | 0.038 | 0.027 | 0.049 |
| 1064.52 | 0.037 | 0.022 | 0.053 |
| 1064.92 | 0.035 | 0.022 | 0.048 |
| 1065.51 | 0.037 | 0.021 | 0.053 |
| 1065.91 | 0.037 | 0.021 | 0.053 |
| 1066.5 | 0.035 | 0.021 | 0.048 |
| 1067.1 | 0.035 | 0.021 | 0.048 |
| 1067.5 | 0.037 | 0.021 | 0.052 |
| 1068.09 | 0.034 | 0.021 | 0.048 |
| 1068.49 | 0.034 | 0.016 | 0.052 |
| 1069.09 | 0.039 | 0.021 | 0.057 |
| 1069.49 | 0.037 | 0.021 | 0.052 |
| 1070.08 | 0.034 | 0.016 | 0.052 |
| 1070.48 | 0.036 | 0.016 | 0.056 |
| 1071.08 | 0.036 | 0.021 | 0.052 |
| 1071.48 | 0.036 | 0.016 | 0.056 |
| 1072.08 | 0.036 | 0.021 | 0.051 |
| 1072.49 | 0.036 | 0.016 | 0.056 |
| 1073.09 | 0.036 | 0.016 | 0.056 |
| 1073.49 | 0.036 | 0.016 | 0.056 |
| 1074.09 | 0.038 | 0.015 | 0.06 |
| 1074.5 | 0.038 | 0.015 | 0.06 |
| 1075.1 | 0.033 | 0.01 | 0.055 |
| 1075.51 | 0.04 | 0.021 | 0.06 |
| 1075.91 | 0.04 | 0.02 | 0.06 |
| 1076.52 | 0.04 | 0.02 | 0.06 |
| 1076.93 | 0.04 | 0.015 | 0.064 |
| 1077.54 | 0.04 | 0.015 | 0.064 |
| 1077.95 | 0.04 | 0.015 | 0.064 |
| 1078.56 | 0.042 | 0.02 | 0.064 |
| 1078.97 | 0.044 | 0.02 | 0.068 |
| 1079.59 | 0.042 | 0.02 | 0.063 |
| 1080.0 | 0.039 | 0.015 | 0.063 |
| 1080.41 | 0.044 | 0.02 | 0.068 |
| 1081.03 | 0.044 | 0.015 | 0.072 |
| 1081.44 | 0.046 | 0.02 | 0.072 |
| 1082.06 | 0.046 | 0.02 | 0.072 |
| 1082.48 | 0.046 | 0.015 | 0.076 |
| 1083.1 | 0.046 | 0.015 | 0.076 |
| 1083.52 | 0.048 | 0.015 | 0.08 |
| 1083.94 | 0.045 | 0.01 | 0.08 |
| 1084.56 | 0.045 | 0.01 | 0.08 |
| 1084.98 | 0.052 | 0.015 | 0.089 |
| 1085.4 | 0.052 | 0.015 | 0.089 |
| 1086.03 | 0.052 | 0.015 | 0.089 |
| 1086.46 | 0.056 | 0.02 | 0.093 |
| 1087.09 | 0.054 | 0.015 | 0.093 |
| 1087.52 | 0.058 | 0.015 | 0.101 |
| 1087.94 | 0.063 | 0.02 | 0.106 |
| 1088.58 | 0.065 | 0.02 | 0.11 |
| 1089.01 | 0.062 | 0.015 | 0.11 |
| 1089.44 | 0.064 | 0.015 | 0.114 |
| 1090.08 | 0.069 | 0.015 | 0.123 |
| 1090.51 | 0.075 | 0.015 | 0.135 |
| 1090.94 | 0.073 | 0.015 | 0.131 |
| 1091.59 | 0.084 | 0.02 | 0.148 |
| 1092.02 | 0.081 | 0.015 | 0.148 |
| 1092.46 | 0.086 | 0.02 | 0.152 |
| 1093.11 | 0.094 | 0.015 | 0.174 |
| 1093.54 | 0.096 | 0.015 | 0.178 |
| 1093.98 | 0.103 | 0.015 | 0.191 |
| 1094.42 | 0.111 | 0.019 | 0.203 |
| 1095.08 | 0.118 | 0.015 | 0.22 |
| 1095.52 | 0.128 | 0.019 | 0.237 |
| 1095.96 | 0.137 | 0.019 | 0.255 |
| 1096.4 | 0.145 | 0.015 | 0.276 |
| 1097.07 | 0.162 | 0.014 | 0.31 |
| 1097.51 | 0.173 | 0.01 | 0.336 |
| 1097.96 | 0.19 | 0.019 | 0.361 |
| 1098.41 | 0.207 | 0.014 | 0.399 |
| 1099.08 | 0.239 | 0.014 | 0.463 |
| 1099.53 | 0.267 | 0.019 | 0.514 |
| 1099.98 | 0.296 | 0.014 | 0.578 |
| 1100.43 | 0.337 | 0.019 | 0.654 |
| 1101.1 | 0.409 | 0.019 | 0.799 |
| 1101.56 | 0.468 | 0.014 | 0.922 |
| 1102.01 | 0.545 | 0.019 | 1.071 |
| 1102.47 | 0.643 | 0.019 | 1.267 |
| 1102.92 | 0.76 | 0.014 | 1.505 |
| 1103.61 | 1.013 | 0.019 | 2.006 |
| 1104.07 | 1.238 | 0.014 | 2.461 |
| 1104.53 | 1.57 | 0.019 | 3.121 |
| 1104.99 | 1.977 | 0.019 | 3.935 |
| 1105.45 | 2.537 | 0.019 | 5.055 |
| 1105.91 | 3.243 | 0.019 | 6.467 |
| 1106.61 | 4.628 | 0.024 | 9.233 |
| 1107.07 | 5.736 | 0.019 | 11.454 |
| 1107.54 | 6.834 | 0.019 | 13.649 |
| 1108.0 | 8.005 | 0.019 | 15.992 |
| 1108.47 | 9.106 | 0.024 | 18.187 |
| 1108.94 | 10.043 | 0.024 | 20.062 |
| 1109.41 | 10.881 | 0.024 | 21.737 |
| 1110.11 | 11.926 | 0.024 | 23.828 |
| 1110.58 | 12.488 | 0.029 | 24.948 |
| 1111.06 | 12.976 | 0.019 | 25.934 |
| 1111.53 | 13.436 | 0.029 | 26.844 |
| 1112.0 | 13.831 | 0.029 | 27.632 |
| 1112.48 | 14.11 | 0.029 | 28.19 |
| 1112.96 | 14.37 | 0.024 | 28.716 |
| 1113.43 | 14.583 | 0.029 | 29.138 |
| 1113.91 | 14.75 | 0.024 | 29.477 |
| 1114.39 | 14.924 | 0.024 | 29.824 |
| 1115.11 | 15 | 0.029 | 29.971 |
| 1115.59 | 15.066 | 0.029 | 30.104 |
| 1116.07 | 15.055 | 0.024 | 30.086 |
| 1116.56 | 15.106 | 0.029 | 30.183 |
| 1117.04 | 15.047 | 0.029 | 30.065 |
| 1117.52 | 14.921 | 0.024 | 29.818 |
| 1118.01 | 14.754 | 0.024 | 29.484 |
| 1118.49 | 14.413 | 0.029 | 28.796 |
| 1118.98 | 13.926 | 0.024 | 27.829 |
| 1119.47 | 13.265 | 0.029 | 26.501 |
| 1119.96 | 12.447 | 0.029 | 24.865 |
| 1120.45 | 11.487 | 0.029 | 22.945 |
| 1120.94 | 10.436 | 0.029 | 20.843 |
| 1121.43 | 9.347 | 0.029 | 18.665 |
| 1121.92 | 8.362 | 0.029 | 16.694 |
| 1122.41 | 7.503 | 0.029 | 14.978 |
| 1122.91 | 6.749 | 0.029 | 13.469 |
| 1123.4 | 6.21 | 0.029 | 12.392 |
| 1123.89 | 5.771 | 0.019 | 11.524 |
| 1124.39 | 5.51 | 0.024 | 10.997 |
| 1124.89 | 5.35 | 0.024 | 10.677 |
| 1125.38 | 5.25 | 0.029 | 10.472 |
| 1125.88 | 5.223 | 0.024 | 10.421 |
| 1126.38 | 5.27 | 0.029 | 10.511 |
| 1126.88 | 5.367 | 0.029 | 10.705 |
| 1127.38 | 5.503 | 0.029 | 10.977 |
| 1127.88 | 5.704 | 0.029 | 11.378 |
| 1128.38 | 5.959 | 0.024 | 11.895 |
| 1128.88 | 6.304 | 0.029 | 12.579 |
| 1129.38 | 6.67 | 0.029 | 13.31 |
| 1129.88 | 7.153 | 0.024 | 14.283 |
| 1130.39 | 7.679 | 0.029 | 15.329 |
| 1130.89 | 8.337 | 0.029 | 16.644 |
| 1131.4 | 9.094 | 0.034 | 18.154 |
| 1131.9 | 9.973 | 0.034 | 19.911 |
| 1132.41 | 10.897 | 0.029 | 21.765 |
| 1132.91 | 12.037 | 0.034 | 24.04 |
| 1133.42 | 13.237 | 0.034 | 26.439 |
| 1133.93 | 14.539 | 0.034 | 29.044 |
| 1134.43 | 15.946 | 0.034 | 31.857 |
| 1134.94 | 17.368 | 0.039 | 34.698 |
| 1135.45 | 18.834 | 0.039 | 37.629 |
| 1135.96 | 20.266 | 0.039 | 40.494 |
| 1136.47 | 21.674 | 0.039 | 43.31 |
| 1136.98 | 22.984 | 0.044 | 45.924 |
| 1137.49 | 24.195 | 0.049 | 48.341 |
| 1138.0 | 25.37 | 0.049 | 50.691 |
| 1138.51 | 26.358 | 0.049 | 52.667 |
| 1139.02 | 27.195 | 0.049 | 54.341 |
| 1139.53 | 28.057 | 0.053 | 56.06 |
| 1140.05 | 28.813 | 0.058 | 57.567 |
| 1140.56 | 29.336 | 0.058 | 58.613 |
| 1141.07 | 29.787 | 0.063 | 59.511 |
| 1141.58 | 30.152 | 0.063 | 60.241 |
| 1142.1 | 30.396 | 0.068 | 60.724 |
| 1142.61 | 30.625 | 0.073 | 61.176 |
| 1143.13 | 30.623 | 0.073 | 61.173 |
| 1143.38 | 30.578 | 0.078 | 61.079 |
| 1143.9 | 30.466 | 0.078 | 60.854 |
| 1144.41 | 30.214 | 0.088 | 60.34 |
| 1144.93 | 29.833 | 0.098 | 59.569 |
| 1145.44 | 29.379 | 0.113 | 58.645 |
| 1145.96 | 28.712 | 0.122 | 57.302 |
| 1146.47 | 27.927 | 0.147 | 55.706 |
| 1146.99 | 26.95 | 0.177 | 53.723 |
| 1147.5 | 25.874 | 0.211 | 51.538 |
| 1148.02 | 24.643 | 0.275 | 49.01 |
| 1148.54 | 23.399 | 0.373 | 46.424 |
| 1149.05 | 22.13 | 0.54 | 43.72 |
| 1149.57 | 20.978 | 0.807 | 41.15 |
| 1150.08 | 19.913 | 1.354 | 38.472 |
| 1150.6 | 19.093 | 2.139 | 36.048 |
| 1151.12 | 18.53 | 3.422 | 33.637 |
| 1151.63 | 18.205 | 4.782 | 31.628 |
| 1151.89 | 18.164 | 5.688 | 30.64 |
| 1152.41 | 18.105 | 7.373 | 28.837 |
| 1152.92 | 18.054 | 8.755 | 27.353 |
| 1153.44 | 17.963 | 9.868 | 26.058 |
| 1153.96 | 17.851 | 10.733 | 24.968 |
| 1154.47 | 17.775 | 11.479 | 24.072 |
| 1154.99 | 17.658 | 11.93 | 23.387 |
| 1155.5 | 17.605 | 12.405 | 22.805 |
| 1156.02 | 17.581 | 12.813 | 22.35 |
| 1156.54 | 17.642 | 13.25 | 22.035 |
| 1157.05 | 17.674 | 13.507 | 21.841 |
| 1157.57 | 17.72 | 13.677 | 21.764 |
| 1158.08 | 17.753 | 13.719 | 21.788 |
| 1158.6 | 17.739 | 13.568 | 21.91 |
| 1159.11 | 17.547 | 12.95 | 22.144 |
| 1159.63 | 17.211 | 11.943 | 22.479 |
| 1159.88 | 16.98 | 11.274 | 22.686 |
| 1160.4 | 16.377 | 9.565 | 23.189 |
| 1160.91 | 15.793 | 7.831 | 23.755 |
| 1161.43 | 15.245 | 5.99 | 24.5 |
| 1161.94 | 14.894 | 4.516 | 25.272 |
| 1162.45 | 14.789 | 3.262 | 26.316 |
| 1162.97 | 14.969 | 2.556 | 27.382 |
| 1163.48 | 15.36 | 2.097 | 28.623 |
| 1163.99 | 15.926 | 1.862 | 29.989 |
| 1164.5 | 16.662 | 1.711 | 31.614 |
| 1165.01 | 17.447 | 1.645 | 33.25 |
| 1165.53 | 18.354 | 1.616 | 35.093 |
| 1166.04 | 19.318 | 1.627 | 37.009 |
| 1166.55 | 20.496 | 1.661 | 39.331 |
| 1167.06 | 21.61 | 1.728 | 41.493 |
| 1167.57 | 22.89 | 1.824 | 43.956 |
| 1168.08 | 24.156 | 1.951 | 46.361 |
| 1168.58 | 25.589 | 2.127 | 49.05 |
| 1169.09 | 26.952 | 2.35 | 51.554 |
| 1169.6 | 28.453 | 2.661 | 54.245 |
| 1170.11 | 29.839 | 3.028 | 56.65 |
| 1170.61 | 31.467 | 3.524 | 59.41 |
| 1171.12 | 32.979 | 4.213 | 61.744 |
| 1171.63 | 34.585 | 5.121 | 64.049 |
| 1171.88 | 35.381 | 5.706 | 65.057 |
| 1172.38 | 37.206 | 7.215 | 67.196 |
| 1172.89 | 39.109 | 9.131 | 69.088 |
| 1173.39 | 41.093 | 11.525 | 70.662 |
| 1173.89 | 43.307 | 14.467 | 72.147 |
| 1174.4 | 45.557 | 17.707 | 73.407 |
| 1174.9 | 47.704 | 20.954 | 74.453 |
| 1175.4 | 49.691 | 24.201 | 75.182 |
| 1175.9 | 51.359 | 27.003 | 75.715 |
| 1176.4 | 52.732 | 29.463 | 76.001 |
| 1176.9 | 53.73 | 31.291 | 76.169 |
| 1177.4 | 54.484 | 33.03 | 75.937 |
| 1177.9 | 54.881 | 34.372 | 75.391 |
| 1178.39 | 55.028 | 35.376 | 74.68 |
| 1178.89 | 54.995 | 36.261 | 73.729 |
| 1179.39 | 54.677 | 36.739 | 72.615 |
| 1179.88 | 54.154 | 37.082 | 71.226 |
| 1180.62 | 54.594 | 38.651 | 70.536 |
| 1181.12 | 53.389 | 38.022 | 68.757 |
| 1181.61 | 51.747 | 36.725 | 66.77 |
| 1182.1 | 49.787 | 34.908 | 64.666 |
| 1182.59 | 47.179 | 32.068 | 62.29 |
| 1183.08 | 44.573 | 29.06 | 60.087 |
| 1183.57 | 41.596 | 25.395 | 57.796 |
| 1184.06 | 38.731 | 21.836 | 55.626 |
| 1184.55 | 35.787 | 18.325 | 53.248 |
| 1185.03 | 33.367 | 15.497 | 51.238 |
| 1185.52 | 30.995 | 12.869 | 49.122 |
| 1186.01 | 29.127 | 10.976 | 47.279 |
| 1186.49 | 27.375 | 9.379 | 45.371 |
| 1186.97 | 26.031 | 8.224 | 43.837 |
| 1187.46 | 24.808 | 7.312 | 42.304 |
| 1187.94 | 23.835 | 6.669 | 41.001 |
| 1188.42 | 22.917 | 6.124 | 39.711 |
| 1188.9 | 22.181 | 5.727 | 38.635 |
| 1189.62 | 21.271 | 5.267 | 37.276 |
| 1190.1 | 20.767 | 5.048 | 36.487 |
| 1190.57 | 20.342 | 4.876 | 35.808 |
| 1191.05 | 20.002 | 4.754 | 35.249 |
| 1191.53 | 19.726 | 4.676 | 34.776 |
| 1192.0 | 19.525 | 4.625 | 34.425 |
| 1192.47 | 19.381 | 4.602 | 34.16 |
| 1192.95 | 19.298 | 4.612 | 33.985 |
| 1193.42 | 19.272 | 4.652 | 33.892 |
| 1193.89 | 19.307 | 4.71 | 33.903 |
| 1194.59 | 19.437 | 4.849 | 34.026 |
| 1195.06 | 19.611 | 4.992 | 34.229 |
| 1195.53 | 19.816 | 5.149 | 34.484 |
| 1195.99 | 20.079 | 5.351 | 34.806 |
| 1196.46 | 20.422 | 5.586 | 35.257 |
| 1196.92 | 20.815 | 5.87 | 35.76 |
| 1197.39 | 21.248 | 6.188 | 36.308 |
| 1198.08 | 22.062 | 6.797 | 37.327 |
| 1198.54 | 22.697 | 7.29 | 38.103 |
| 1199.0 | 23.399 | 7.818 | 38.981 |
| 1199.46 | 24.181 | 8.5 | 39.862 |
| 1199.92 | 25.06 | 9.244 | 40.876 |
| 1200.61 | 26.582 | 10.659 | 42.506 |
| 1201.06 | 27.697 | 11.766 | 43.628 |
| 1201.52 | 29.044 | 13.157 | 44.932 |
| 1201.97 | 30.424 | 14.62 | 46.228 |
| 1202.42 | 32.054 | 16.437 | 47.671 |
| 1203.1 | 34.718 | 19.554 | 49.882 |
| 1203.55 | 36.707 | 22.045 | 51.369 |
| 1204.0 | 38.81 | 24.717 | 52.903 |
| 1204.45 | 41.1 | 27.508 | 54.693 |
| 1204.9 | 43.376 | 30.418 | 56.335 |
| 1205.57 | 46.763 | 34.735 | 58.79 |
| 1206.01 | 49.205 | 37.876 | 60.534 |
| 1206.46 | 51.4 | 40.608 | 62.192 |
| 1206.9 | 53.625 | 43.344 | 63.907 |
| 1207.57 | 56.632 | 46.813 | 66.451 |
| 1208.01 | 58.475 | 48.849 | 68.101 |
| 1208.45 | 60.164 | 50.64 | 69.689 |
| 1209.11 | 62.329 | 52.724 | 71.934 |
| 1209.54 | 63.508 | 53.687 | 73.328 |
| 1209.98 | 64.476 | 54.341 | 74.61 |
| 1210.42 | 65.369 | 54.831 | 75.908 |
| 1211.07 | 66.267 | 54.991 | 77.543 |
| 1211.5 | 66.579 | 54.61 | 78.547 |
| 1211.94 | 66.524 | 53.671 | 79.378 |
| 1212.58 | 66.049 | 51.692 | 80.406 |
| 1213.01 | 65.451 | 49.893 | 81.009 |
| 1213.44 | 64.712 | 48.023 | 81.4 |
| 1214.09 | 63.119 | 44.41 | 81.827 |
| 1214.51 | 61.736 | 41.53 | 81.942 |
| 1214.94 | 60.304 | 38.73 | 81.878 |
| 1215.58 | 57.96 | 34.379 | 81.542 |
| 1216.0 | 56.426 | 31.669 | 81.183 |
| 1216.43 | 54.797 | 28.892 | 80.703 |
| 1217.06 | 52.505 | 25.285 | 79.725 |
| 1217.48 | 51.046 | 23.188 | 78.904 |
| 1217.9 | 49.687 | 21.293 | 78.081 |
| 1218.53 | 47.707 | 18.9 | 76.515 |
| 1218.95 | 46.419 | 17.489 | 75.348 |
| 1219.58 | 44.663 | 15.826 | 73.501 |
| 1220.0 | 43.485 | 14.833 | 72.138 |
| 1220.41 | 42.375 | 13.983 | 70.766 |
| 1221.04 | 40.817 | 12.95 | 68.684 |
| 1221.45 | 39.77 | 12.372 | 67.169 |
| 1222.07 | 38.315 | 11.629 | 65.001 |
| 1222.48 | 37.344 | 11.207 | 63.48 |
| 1223.1 | 36.005 | 10.69 | 61.32 |
| 1223.51 | 35.194 | 10.418 | 59.969 |
| 1223.92 | 34.34 | 10.178 | 58.502 |
| 1224.53 | 33.155 | 9.888 | 56.423 |
| 1224.94 | 32.426 | 9.742 | 55.11 |
| 1225.55 | 31.4 | 9.587 | 53.213 |
| 1225.96 | 30.802 | 9.517 | 52.086 |
| 1226.57 | 29.95 | 9.467 | 50.433 |
| 1226.98 | 29.437 | 9.465 | 49.409 |
| 1227.58 | 28.748 | 9.512 | 47.984 |
| 1227.99 | 28.33 | 9.59 | 47.07 |
| 1228.59 | 27.79 | 9.742 | 45.838 |
| 1229.0 | 27.507 | 9.878 | 45.136 |
| 1229.6 | 27.141 | 10.129 | 44.153 |
| 1230.0 | 26.946 | 10.319 | 43.573 |
| 1230.6 | 26.736 | 10.708 | 42.765 |
| 1231.0 | 26.642 | 10.988 | 42.297 |
| 1231.6 | 26.606 | 11.495 | 41.718 |
| 1232.0 | 26.664 | 11.916 | 41.411 |
| 1232.6 | 26.819 | 12.631 | 41.007 |
| 1233.0 | 26.993 | 13.169 | 40.818 |
| 1233.6 | 27.34 | 14.063 | 40.617 |
| 1233.99 | 27.607 | 14.707 | 40.507 |
| 1234.59 | 28.207 | 15.94 | 40.473 |
| 1234.98 | 28.672 | 16.839 | 40.505 |
| 1235.58 | 29.523 | 18.393 | 40.652 |
| 1235.97 | 30.178 | 19.569 | 40.788 |
| 1236.57 | 31.32 | 21.542 | 41.098 |
| 1236.96 | 32.203 | 23.021 | 41.384 |
| 1237.56 | 33.651 | 25.448 | 41.854 |
| 1237.95 | 34.634 | 27.067 | 42.201 |
| 1238.54 | 36.495 | 30.108 | 42.883 |
| 1238.94 | 37.814 | 32.254 | 43.375 |
| 1239.53 | 39.828 | 35.455 | 44.201 |
| 1239.92 | 41.272 | 37.74 | 44.805 |
| 1240.51 | 43.508 | 41.224 | 45.792 |
| 1241.1 | 45.691 | 44.509 | 46.873 |
| 1241.5 | 47.256 | 46.825 | 47.687 |
| 1242.09 | 49.43 | 49.906 | 48.954 |
| 1242.48 | 50.824 | 51.812 | 49.835 |
| 1243.07 | 52.869 | 54.46 | 51.278 |
| 1243.46 | 54.099 | 55.945 | 52.253 |
| 1244.05 | 55.886 | 57.904 | 53.868 |
| 1244.44 | 56.858 | 58.72 | 54.996 |
| 1245.04 | 58.177 | 59.674 | 56.681 |
| 1245.43 | 59.044 | 60.166 | 57.923 |
| 1246.02 | 59.909 | 60.092 | 59.725 |
| 1246.41 | 60.419 | 59.849 | 60.99 |
| 1247.0 | 60.978 | 59.032 | 62.924 |
| 1247.59 | 61.17 | 57.543 | 64.796 |
| 1247.99 | 61.176 | 56.263 | 66.089 |
| 1248.58 | 60.9 | 53.812 | 67.988 |
| 1248.98 | 60.613 | 52.097 | 69.129 |
| 1249.57 | 59.977 | 48.957 | 70.998 |
| 1249.96 | 59.478 | 46.742 | 72.215 |
| 1250.56 | 58.615 | 43.406 | 73.824 |
| 1250.95 | 57.947 | 41.01 | 74.885 |
| 1251.55 | 57.004 | 37.581 | 76.426 |
| 1251.95 | 56.368 | 35.362 | 77.373 |
| 1252.54 | 55.456 | 32.285 | 78.627 |
| 1252.94 | 54.912 | 30.475 | 79.349 |
| 1253.54 | 54.067 | 27.809 | 80.326 |
| 1253.94 | 53.526 | 26.176 | 80.876 |
| 1254.53 | 52.805 | 24.096 | 81.515 |
| 1254.93 | 52.337 | 22.785 | 81.889 |
| 1255.53 | 51.654 | 21.109 | 82.199 |
| 1255.93 | 51.174 | 20.061 | 82.287 |
| 1256.54 | 50.484 | 18.755 | 82.212 |
| 1256.94 | 50.06 | 18.021 | 82.1 |
| 1257.54 | 49.31 | 16.966 | 81.655 |
| 1257.95 | 48.813 | 16.363 | 81.263 |
| 1258.55 | 48.042 | 15.589 | 80.496 |
| 1258.96 | 47.474 | 15.127 | 79.821 |
| 1259.56 | 46.638 | 14.543 | 78.733 |
| 1259.97 | 46.054 | 14.208 | 77.9 |
| 1260.58 | 45.158 | 13.781 | 76.536 |
| 1260.99 | 44.563 | 13.54 | 75.586 |
| 1261.6 | 43.588 | 13.245 | 73.93 |
| 1262.01 | 42.979 | 13.096 | 72.861 |
| 1262.42 | 42.359 | 12.984 | 71.735 |
| 1263.04 | 41.396 | 12.854 | 69.938 |
| 1263.45 | 40.793 | 12.807 | 68.778 |
| 1264.07 | 39.825 | 12.78 | 66.869 |
| 1264.48 | 39.236 | 12.811 | 65.662 |
| 1265.1 | 38.383 | 12.888 | 63.879 |
| 1265.51 | 37.803 | 12.966 | 62.641 |
| 1265.93 | 37.291 | 13.084 | 61.498 |
| 1266.56 | 36.539 | 13.319 | 59.758 |
| 1266.97 | 36.056 | 13.51 | 58.602 |
| 1267.6 | 35.44 | 13.838 | 57.043 |
| 1268.02 | 35.059 | 14.122 | 55.995 |
| 1268.44 | 34.732 | 14.402 | 55.061 |
| 1269.07 | 34.27 | 14.946 | 53.593 |
| 1269.49 | 34.042 | 15.362 | 52.722 |
| 1269.92 | 33.85 | 15.815 | 51.885 |
| 1270.55 | 33.656 | 16.606 | 50.707 |
| 1270.98 | 33.591 | 17.147 | 50.035 |
| 1271.41 | 33.574 | 17.801 | 49.346 |
| 1272.05 | 33.645 | 18.883 | 48.407 |
| 1272.47 | 33.769 | 19.69 | 47.848 |
| 1272.9 | 33.957 | 20.565 | 47.348 |
| 1273.55 | 34.338 | 21.979 | 46.696 |
| 1273.98 | 34.697 | 23.111 | 46.282 |
| 1274.41 | 35.126 | 24.287 | 45.965 |
| 1275.06 | 35.882 | 26.266 | 45.499 |
| 1275.5 | 36.458 | 27.652 | 45.264 |
| 1275.93 | 37.1 | 29.155 | 45.045 |
| 1276.59 | 38.259 | 31.684 | 44.835 |
| 1277.02 | 39.045 | 33.343 | 44.748 |
| 1277.46 | 39.972 | 35.228 | 44.716 |
| 1277.9 | 40.846 | 36.99 | 44.702 |
| 1278.56 | 42.38 | 40.004 | 44.755 |
| 1279.0 | 43.425 | 41.962 | 44.888 |
| 1279.45 | 44.494 | 43.953 | 45.036 |
| 1280.11 | 46.12 | 46.935 | 45.305 |
| 1280.56 | 47.194 | 48.817 | 45.57 |
| 1281.0 | 48.273 | 50.674 | 45.872 |
| 1281.45 | 49.253 | 52.297 | 46.209 |
| 1281.9 | 50.269 | 53.931 | 46.607 |
| 1282.57 | 51.625 | 56.021 | 47.23 |
| 1283.02 | 52.427 | 57.131 | 47.724 |
| 1283.47 | 53.152 | 58.047 | 48.257 |
| 1283.93 | 53.844 | 58.833 | 48.854 |
| 1284.61 | 54.62 | 59.417 | 49.823 |
| 1285.06 | 55.021 | 59.544 | 50.497 |
| 1285.52 | 55.338 | 59.389 | 51.288 |
| 1285.97 | 55.504 | 58.973 | 52.035 |
| 1286.43 | 55.616 | 58.333 | 52.899 |
| 1286.89 | 55.625 | 57.532 | 53.718 |
| 1287.58 | 55.432 | 55.732 | 55.133 |
| 1288.04 | 55.188 | 54.299 | 56.077 |
| 1288.5 | 54.889 | 52.692 | 57.087 |
| 1288.96 | 54.507 | 50.924 | 58.09 |
| 1289.43 | 54.098 | 49.002 | 59.194 |
| 1289.89 | 53.621 | 47.036 | 60.206 |
| 1290.59 | 52.924 | 44.008 | 61.84 |
| 1291.06 | 52.387 | 41.845 | 62.929 |
| 1291.52 | 51.963 | 39.839 | 64.087 |
| 1291.99 | 51.463 | 37.69 | 65.236 |
| 1292.46 | 51.096 | 35.842 | 66.349 |
| 1292.93 | 50.719 | 33.933 | 67.505 |
| 1293.4 | 50.413 | 32.238 | 68.587 |
| 1294.11 | 49.95 | 29.718 | 70.181 |
| 1294.59 | 49.739 | 28.193 | 71.286 |
| 1295.06 | 49.566 | 26.86 | 72.272 |
| 1295.54 | 49.446 | 25.616 | 73.276 |
| 1296.01 | 49.297 | 24.393 | 74.201 |
| 1296.49 | 49.189 | 23.328 | 75.05 |
| 1296.97 | 49.119 | 22.362 | 75.877 |
| 1297.45 | 49.041 | 21.47 | 76.613 |
| 1297.93 | 48.974 | 20.665 | 77.283 |
| 1298.41 | 48.91 | 19.946 | 77.875 |
| 1298.89 | 48.819 | 19.27 | 78.369 |
| 1299.61 | 48.694 | 18.39 | 78.997 |
| 1300.1 | 48.515 | 17.981 | 79.049 |
| 1300.58 | 48.368 | 17.489 | 79.248 |
| 1301.07 | 48.219 | 17.092 | 79.346 |
| 1301.55 | 48.053 | 16.716 | 79.39 |
| 1302.04 | 47.879 | 16.397 | 79.362 |
| 1302.53 | 47.656 | 16.115 | 79.197 |
| 1303.02 | 47.425 | 15.884 | 78.966 |
| 1303.51 | 47.165 | 15.679 | 78.65 |
| 1304.0 | 46.881 | 15.511 | 78.25 |
| 1304.49 | 46.546 | 15.38 | 77.713 |
| 1304.98 | 46.221 | 15.273 | 77.168 |
| 1305.47 | 45.86 | 15.208 | 76.512 |
| 1305.96 | 45.496 | 15.17 | 75.823 |
| 1306.46 | 45.107 | 15.175 | 75.039 |
| 1306.95 | 44.723 | 15.202 | 74.245 |
| 1307.45 | 44.298 | 15.259 | 73.336 |
| 1307.94 | 43.908 | 15.344 | 72.472 |
| 1308.44 | 43.444 | 15.467 | 71.421 |
| 1308.94 | 43.06 | 15.626 | 70.494 |
| 1309.43 | 42.609 | 15.819 | 69.4 |
| 1309.93 | 42.203 | 16.019 | 68.387 |
| 1310.43 | 41.807 | 16.29 | 67.323 |
| 1310.93 | 41.468 | 16.576 | 66.359 |
| 1311.43 | 41.101 | 16.918 | 65.285 |
| 1311.93 | 40.768 | 17.287 | 64.248 |
| 1312.43 | 40.472 | 17.738 | 63.205 |
| 1312.94 | 40.168 | 18.152 | 62.183 |
| 1313.44 | 39.929 | 18.683 | 61.176 |
| 1313.94 | 39.735 | 19.249 | 60.22 |
| 1314.44 | 39.565 | 19.869 | 59.261 |
| 1314.95 | 39.439 | 20.503 | 58.375 |
| 1315.45 | 39.354 | 21.264 | 57.443 |
| 1315.96 | 39.299 | 21.994 | 56.604 |
| 1316.47 | 39.326 | 22.861 | 55.791 |
| 1316.97 | 39.397 | 23.719 | 55.074 |
| 1317.48 | 39.556 | 24.762 | 54.351 |
| 1317.99 | 39.739 | 25.816 | 53.662 |
| 1318.49 | 39.963 | 26.941 | 52.985 |
| 1319.0 | 40.242 | 28.08 | 52.404 |
| 1319.51 | 40.642 | 29.429 | 51.855 |
| 1320.02 | 41.016 | 30.69 | 51.341 |
| 1320.53 | 41.482 | 32.088 | 50.875 |
| 1321.04 | 41.973 | 33.475 | 50.471 |
| 1321.55 | 42.577 | 35.086 | 50.069 |
| 1322.06 | 43.141 | 36.52 | 49.762 |
| 1322.57 | 43.821 | 38.137 | 49.504 |
| 1323.08 | 44.45 | 39.65 | 49.251 |
| 1323.59 | 45.133 | 41.242 | 49.025 |
| 1324.1 | 45.813 | 42.714 | 48.912 |
| 1324.61 | 46.513 | 44.271 | 48.755 |
| 1325.13 | 47.147 | 45.6 | 48.694 |
| 1325.38 | 47.512 | 46.329 | 48.696 |
| 1325.89 | 48.169 | 47.659 | 48.68 |
| 1326.41 | 48.76 | 48.817 | 48.704 |
| 1326.92 | 49.345 | 49.88 | 48.81 |
| 1327.43 | 49.875 | 50.814 | 48.936 |
| 1327.95 | 50.372 | 51.628 | 49.116 |
| 1328.46 | 50.772 | 52.232 | 49.313 |
| 1328.97 | 51.118 | 52.689 | 49.546 |
| 1329.49 | 51.425 | 52.965 | 49.885 |
| 1330.0 | 51.668 | 53.14 | 50.196 |
| 1330.51 | 51.833 | 53.068 | 50.598 |
| 1331.03 | 51.912 | 52.803 | 51.021 |
| 1331.54 | 51.918 | 52.373 | 51.463 |
| 1332.06 | 51.878 | 51.771 | 51.984 |
| 1332.57 | 51.781 | 51.065 | 52.498 |
| 1333.08 | 51.598 | 50.096 | 53.1 |
| 1333.6 | 51.401 | 49.088 | 53.714 |
| 1334.11 | 51.145 | 47.918 | 54.371 |
| 1334.63 | 50.86 | 46.664 | 55.057 |
| 1334.88 | 50.714 | 45.987 | 55.441 |
| 1335.4 | 50.362 | 44.57 | 56.154 |
| 1335.91 | 50.028 | 43.108 | 56.949 |
| 1336.43 | 49.669 | 41.633 | 57.706 |
| 1336.94 | 49.331 | 40.069 | 58.594 |
| 1337.45 | 49.038 | 38.603 | 59.473 |
| 1337.97 | 48.731 | 37.055 | 60.406 |
| 1338.48 | 48.478 | 35.656 | 61.299 |
| 1338.99 | 48.199 | 34.174 | 62.223 |
| 1339.51 | 48.022 | 32.88 | 63.165 |
| 1340.02 | 47.842 | 31.524 | 64.161 |
| 1340.53 | 47.687 | 30.332 | 65.043 |
| 1341.05 | 47.583 | 29.089 | 66.077 |
| 1341.56 | 47.513 | 28.048 | 66.978 |
| 1342.07 | 47.488 | 26.949 | 68.026 |
| 1342.58 | 47.467 | 26.026 | 68.907 |
| 1343.09 | 47.496 | 25.085 | 69.907 |
| 1343.61 | 47.549 | 24.306 | 70.793 |
| 1344.12 | 47.609 | 23.489 | 71.728 |
| 1344.63 | 47.664 | 22.805 | 72.523 |
| 1344.88 | 47.718 | 22.447 | 72.99 |
| 1345.39 | 47.822 | 21.803 | 73.841 |
| 1345.9 | 47.901 | 21.231 | 74.57 |
| 1346.41 | 48.002 | 20.703 | 75.301 |
| 1346.92 | 48.105 | 20.236 | 75.974 |
| 1347.43 | 48.179 | 19.802 | 76.555 |
| 1347.94 | 48.27 | 19.425 | 77.115 |
| 1348.45 | 48.336 | 19.067 | 77.606 |
| 1348.96 | 48.402 | 18.762 | 78.042 |
| 1349.46 | 48.476 | 18.502 | 78.451 |
| 1349.97 | 48.491 | 18.267 | 78.714 |
| 1350.48 | 48.506 | 18.052 | 78.96 |
| 1350.98 | 48.51 | 17.893 | 79.128 |
| 1351.49 | 48.486 | 17.757 | 79.214 |
| 1351.99 | 48.46 | 17.663 | 79.257 |
| 1352.5 | 48.403 | 17.594 | 79.211 |
| 1353.0 | 48.296 | 17.534 | 79.058 |
| 1353.5 | 48.185 | 17.53 | 78.839 |
| 1354.01 | 48.082 | 17.547 | 78.616 |
| 1354.51 | 47.921 | 17.597 | 78.244 |
| 1355.01 | 47.761 | 17.665 | 77.857 |
| 1355.51 | 47.591 | 17.765 | 77.417 |
| 1356.01 | 47.392 | 17.893 | 76.89 |
| 1356.51 | 47.193 | 18.058 | 76.328 |
| 1357.01 | 46.995 | 18.242 | 75.749 |
| 1357.51 | 46.776 | 18.487 | 75.066 |
| 1358.01 | 46.54 | 18.73 | 74.35 |
| 1358.5 | 46.322 | 19.007 | 73.638 |
| 1359.0 | 46.111 | 19.319 | 72.904 |
| 1359.5 | 45.881 | 19.682 | 72.08 |
| 1359.99 | 45.685 | 20.081 | 71.289 |
| 1360.48 | 45.463 | 20.503 | 70.423 |
| 1360.98 | 45.304 | 20.961 | 69.646 |
| 1361.47 | 45.106 | 21.47 | 68.743 |
| 1361.96 | 44.966 | 22.011 | 67.921 |
| 1362.45 | 44.825 | 22.607 | 67.043 |
| 1362.95 | 44.715 | 23.211 | 66.22 |
| 1363.44 | 44.632 | 23.893 | 65.371 |
| 1363.92 | 44.555 | 24.554 | 64.555 |
| 1364.41 | 44.539 | 25.339 | 63.74 |
| 1364.9 | 44.551 | 26.146 | 62.956 |
| 1365.39 | 44.589 | 26.977 | 62.2 |
| 1366.12 | 44.684 | 28.308 | 61.061 |
| 1366.6 | 44.805 | 29.227 | 60.382 |
| 1367.09 | 44.941 | 30.244 | 59.637 |
| 1367.57 | 45.101 | 31.209 | 58.992 |
| 1368.05 | 45.287 | 32.3 | 58.274 |
| 1368.53 | 45.532 | 33.364 | 57.699 |
| 1369.01 | 45.769 | 34.471 | 57.067 |
| 1369.49 | 46.034 | 35.559 | 56.509 |
| 1369.97 | 46.306 | 36.703 | 55.909 |
| 1370.45 | 46.576 | 37.755 | 55.397 |
| 1370.93 | 46.897 | 38.899 | 54.896 |
| 1371.4 | 47.19 | 39.94 | 54.439 |
| 1372.11 | 47.667 | 41.625 | 53.709 |
| 1372.59 | 47.934 | 42.561 | 53.306 |
| 1373.06 | 48.216 | 43.519 | 52.912 |
| 1373.53 | 48.538 | 44.51 | 52.566 |
| 1374.01 | 48.782 | 45.324 | 52.239 |
| 1374.48 | 49.007 | 46.075 | 51.939 |
| 1374.95 | 49.232 | 46.786 | 51.679 |
| 1375.41 | 49.428 | 47.417 | 51.44 |
| 1376.11 | 49.702 | 48.219 | 51.184 |
| 1376.58 | 49.845 | 48.64 | 51.051 |
| 1377.05 | 49.941 | 48.954 | 50.928 |
| 1377.51 | 50.05 | 49.239 | 50.861 |
| 1377.97 | 50.095 | 49.354 | 50.835 |
| 1378.44 | 50.14 | 49.423 | 50.857 |
| 1378.9 | 50.131 | 49.389 | 50.873 |
| 1379.59 | 50.11 | 49.217 | 51.004 |
| 1380.05 | 50.048 | 48.964 | 51.131 |
| 1380.5 | 49.949 | 48.626 | 51.272 |
| 1380.96 | 49.863 | 48.25 | 51.476 |
| 1381.42 | 49.72 | 47.748 | 51.691 |
| 1382.1 | 49.495 | 46.905 | 52.084 |
| 1382.55 | 49.333 | 46.302 | 52.364 |
| 1383.01 | 49.134 | 45.576 | 52.692 |
| 1383.46 | 48.962 | 44.924 | 53 |
| 1383.91 | 48.739 | 44.088 | 53.39 |
| 1384.58 | 48.43 | 42.873 | 53.987 |
| 1385.03 | 48.218 | 42.003 | 54.432 |
| 1385.48 | 48.016 | 41.157 | 54.874 |
| 1385.93 | 47.789 | 40.246 | 55.332 |
| 1386.59 | 47.498 | 38.907 | 56.09 |
| 1387.04 | 47.325 | 38.115 | 56.535 |
| 1387.48 | 47.128 | 37.142 | 57.114 |
| 1387.92 | 46.974 | 36.299 | 57.649 |
| 1388.58 | 46.77 | 35.01 | 58.53 |
| 1389.02 | 46.637 | 34.183 | 59.092 |
| 1389.46 | 46.525 | 33.371 | 59.68 |
| 1389.9 | 46.411 | 32.553 | 60.269 |
| 1390.56 | 46.331 | 31.459 | 61.204 |
| 1390.99 | 46.281 | 30.717 | 61.845 |
| 1391.43 | 46.279 | 30.072 | 62.486 |
| 1392.08 | 46.24 | 29.024 | 63.456 |
| 1392.51 | 46.257 | 28.454 | 64.06 |
| 1392.94 | 46.289 | 27.866 | 64.712 |
| 1393.59 | 46.35 | 27 | 65.699 |
| 1394.01 | 46.418 | 26.482 | 66.354 |
| 1394.44 | 46.503 | 25.966 | 67.04 |
| 1395.08 | 46.63 | 25.261 | 67.998 |
| 1395.51 | 46.742 | 24.822 | 68.663 |
| 1395.93 | 46.851 | 24.434 | 69.269 |
| 1396.57 | 47.01 | 23.875 | 70.145 |
| 1396.99 | 47.143 | 23.497 | 70.79 |
| 1397.42 | 47.239 | 23.173 | 71.305 |
| 1398.05 | 47.448 | 22.717 | 72.18 |
| 1398.47 | 47.58 | 22.413 | 72.747 |
| 1399.1 | 47.827 | 22.071 | 73.583 |
| 1399.52 | 47.973 | 21.843 | 74.103 |
| 1399.93 | 48.094 | 21.64 | 74.549 |
| 1400.56 | 48.308 | 21.37 | 75.247 |
| 1400.97 | 48.436 | 21.209 | 75.663 |
| 1401.59 | 48.639 | 20.997 | 76.28 |
| 1402.01 | 48.746 | 20.872 | 76.62 |
| 1402.42 | 48.841 | 20.765 | 76.917 |
| 1403.04 | 49.026 | 20.644 | 77.407 |
| 1403.45 | 49.126 | 20.582 | 77.669 |
| 1404.06 | 49.288 | 20.517 | 78.059 |
| 1404.47 | 49.364 | 20.489 | 78.24 |
| 1405.09 | 49.481 | 20.486 | 78.477 |
| 1405.49 | 49.534 | 20.488 | 78.581 |
| 1406.1 | 49.602 | 20.528 | 78.677 |
| 1406.51 | 49.658 | 20.583 | 78.734 |
| 1406.91 | 49.724 | 20.659 | 78.789 |
| 1407.52 | 49.753 | 20.777 | 78.729 |
| 1407.93 | 49.775 | 20.88 | 78.67 |
| 1408.53 | 49.794 | 21.054 | 78.534 |
| 1408.93 | 49.796 | 21.195 | 78.396 |
| 1409.53 | 49.782 | 21.44 | 78.125 |
| 1409.94 | 49.771 | 21.61 | 77.931 |
| 1410.54 | 49.756 | 21.891 | 77.622 |
| 1410.94 | 49.738 | 22.14 | 77.337 |
| 1411.53 | 49.713 | 22.48 | 76.946 |
| 1411.93 | 49.682 | 22.748 | 76.615 |
| 1412.53 | 49.63 | 23.171 | 76.089 |
| 1412.93 | 49.6 | 23.452 | 75.748 |
| 1413.52 | 49.554 | 23.965 | 75.143 |
| 1413.92 | 49.553 | 24.315 | 74.791 |
| 1414.51 | 49.527 | 24.847 | 74.208 |
| 1414.91 | 49.52 | 25.268 | 73.773 |
| 1415.5 | 49.507 | 25.902 | 73.112 |
| 1416.09 | 49.505 | 26.573 | 72.437 |
| 1416.49 | 49.518 | 27.058 | 71.979 |
| 1417.08 | 49.556 | 27.796 | 71.315 |
| 1417.47 | 49.578 | 28.317 | 70.84 |
| 1418.06 | 49.626 | 29.132 | 70.119 |
| 1418.45 | 49.69 | 29.714 | 69.666 |
| 1419.04 | 49.8 | 30.608 | 68.992 |
| 1419.43 | 49.897 | 31.248 | 68.546 |
| 1420.02 | 50.054 | 32.204 | 67.903 |
| 1420.41 | 50.138 | 32.856 | 67.419 |
| 1421.0 | 50.338 | 33.901 | 66.776 |
| 1421.59 | 50.54 | 34.925 | 66.156 |
| 1421.98 | 50.689 | 35.662 | 65.715 |
| 1422.56 | 50.968 | 36.802 | 65.135 |
| 1422.96 | 51.142 | 37.576 | 64.709 |
| 1423.54 | 51.446 | 38.707 | 64.185 |
| 1423.93 | 51.655 | 39.461 | 63.849 |
| 1424.52 | 51.989 | 40.667 | 63.31 |
| 1424.91 | 52.213 | 41.437 | 62.99 |
| 1425.5 | 52.553 | 42.579 | 62.528 |
| 1426.08 | 52.903 | 43.734 | 62.072 |
| 1426.47 | 53.148 | 44.48 | 61.815 |
| 1427.06 | 53.48 | 45.502 | 61.458 |
| 1427.45 | 53.734 | 46.257 | 61.211 |
| 1428.04 | 54.059 | 47.219 | 60.9 |
| 1428.43 | 54.258 | 47.836 | 60.68 |
| 1429.02 | 54.578 | 48.741 | 60.414 |
| 1429.41 | 54.759 | 49.222 | 60.297 |
| 1430.0 | 55.029 | 49.984 | 60.075 |
| 1430.59 | 55.266 | 50.628 | 59.904 |
| 1430.98 | 55.39 | 50.972 | 59.808 |
| 1431.57 | 55.579 | 51.439 | 59.718 |
| 1431.96 | 55.682 | 51.678 | 59.686 |
| 1432.56 | 55.773 | 51.914 | 59.631 |
| 1432.95 | 55.827 | 52.049 | 59.606 |
| 1433.54 | 55.868 | 52.105 | 59.631 |
| 1433.94 | 55.858 | 52.054 | 59.663 |
| 1434.53 | 55.843 | 51.946 | 59.741 |
| 1434.93 | 55.78 | 51.767 | 59.794 |
| 1435.52 | 55.697 | 51.437 | 59.956 |
| 1435.92 | 55.611 | 51.175 | 60.046 |
| 1436.51 | 55.447 | 50.645 | 60.25 |
| 1436.91 | 55.319 | 50.225 | 60.413 |
| 1437.51 | 55.123 | 49.572 | 60.675 |
| 1437.91 | 54.976 | 49.062 | 60.89 |
| 1438.51 | 54.726 | 48.275 | 61.176 |
| 1438.91 | 54.535 | 47.667 | 61.403 |
| 1439.51 | 54.258 | 46.75 | 61.766 |
| 1439.91 | 54.072 | 46.108 | 62.036 |
| 1440.52 | 53.781 | 45.065 | 62.496 |
| 1440.92 | 53.6 | 44.358 | 62.841 |
| 1441.53 | 53.298 | 43.325 | 63.27 |
| 1441.93 | 53.129 | 42.624 | 63.633 |
| 1442.54 | 52.849 | 41.517 | 64.181 |
| 1442.95 | 52.71 | 40.891 | 64.53 |
| 1443.56 | 52.454 | 39.772 | 65.137 |
| 1443.97 | 52.304 | 39.083 | 65.525 |
| 1444.58 | 52.12 | 38.075 | 66.166 |
| 1444.99 | 51.994 | 37.409 | 66.579 |
| 1445.6 | 51.833 | 36.41 | 67.257 |
| 1446.02 | 51.748 | 35.779 | 67.717 |
| 1446.43 | 51.675 | 35.201 | 68.15 |
| 1447.05 | 51.598 | 34.328 | 68.868 |
| 1447.46 | 51.522 | 33.729 | 69.316 |
| 1448.08 | 51.504 | 32.945 | 70.063 |
| 1448.5 | 51.474 | 32.398 | 70.551 |
| 1448.92 | 51.472 | 31.923 | 71.021 |
| 1449.54 | 51.497 | 31.211 | 71.782 |
| 1449.96 | 51.522 | 30.745 | 72.299 |
| 1450.59 | 51.573 | 30.119 | 73.026 |
| 1451.01 | 51.618 | 29.709 | 73.526 |
| 1451.43 | 51.695 | 29.342 | 74.048 |
| 1452.07 | 51.808 | 28.841 | 74.775 |
| 1452.49 | 51.873 | 28.502 | 75.245 |
| 1452.91 | 51.956 | 28.198 | 75.714 |
| 1453.55 | 52.096 | 27.756 | 76.437 |
| 1453.98 | 52.205 | 27.514 | 76.895 |
| 1454.41 | 52.325 | 27.283 | 77.367 |
| 1455.05 | 52.478 | 26.953 | 78.003 |
| 1455.48 | 52.596 | 26.764 | 78.428 |
| 1455.91 | 52.693 | 26.579 | 78.808 |
| 1456.56 | 52.872 | 26.361 | 79.383 |
| 1456.99 | 53.004 | 26.225 | 79.782 |
| 1457.42 | 53.111 | 26.113 | 80.109 |
| 1458.08 | 53.297 | 25.986 | 80.608 |
| 1458.51 | 53.393 | 25.904 | 80.881 |
| 1458.95 | 53.505 | 25.853 | 81.156 |
| 1459.61 | 53.67 | 25.799 | 81.54 |
| 1460.05 | 53.788 | 25.795 | 81.78 |
| 1460.49 | 53.894 | 25.817 | 81.971 |
| 1460.93 | 53.988 | 25.831 | 82.144 |
| 1461.59 | 54.109 | 25.887 | 82.33 |
| 1462.03 | 54.216 | 25.96 | 82.472 |
| 1462.48 | 54.288 | 26.042 | 82.535 |
| 1462.92 | 54.373 | 26.146 | 82.6 |
| 1463.59 | 54.492 | 26.332 | 82.652 |
| 1464.04 | 54.543 | 26.496 | 82.59 |
| 1464.49 | 54.609 | 26.646 | 82.571 |
| 1464.94 | 54.687 | 26.852 | 82.522 |
| 1465.39 | 54.748 | 27.079 | 82.416 |
| 1466.07 | 54.815 | 27.393 | 82.237 |
| 1466.52 | 54.857 | 27.669 | 82.045 |
| 1466.97 | 54.929 | 27.96 | 81.898 |
| 1467.43 | 54.975 | 28.262 | 81.687 |
| 1468.11 | 55.034 | 28.758 | 81.31 |
| 1468.57 | 55.074 | 29.119 | 81.029 |
| 1469.03 | 55.147 | 29.507 | 80.788 |
| 1469.49 | 55.189 | 29.903 | 80.475 |
| 1469.95 | 55.22 | 30.316 | 80.123 |
| 1470.41 | 55.275 | 30.772 | 79.777 |
| 1471.1 | 55.36 | 31.5 | 79.22 |
| 1471.57 | 55.397 | 31.938 | 78.856 |
| 1472.03 | 55.456 | 32.525 | 78.386 |
| 1472.49 | 55.529 | 33.042 | 78.016 |
| 1472.96 | 55.623 | 33.645 | 77.602 |
| 1473.43 | 55.686 | 34.2 | 77.172 |
| 1473.9 | 55.777 | 34.864 | 76.689 |
| 1474.6 | 55.953 | 35.842 | 76.063 |
| 1475.07 | 56.06 | 36.509 | 75.611 |
| 1475.54 | 56.164 | 37.184 | 75.143 |
| 1476.01 | 56.288 | 37.919 | 74.657 |
| 1476.49 | 56.45 | 38.681 | 74.219 |
| 1476.96 | 56.603 | 39.439 | 73.767 |
| 1477.43 | 56.726 | 40.168 | 73.283 |
| 1477.91 | 56.893 | 40.951 | 72.834 |
| 1478.39 | 57.074 | 41.749 | 72.399 |
| 1479.1 | 57.356 | 42.933 | 71.778 |
| 1479.58 | 57.553 | 43.789 | 71.317 |
| 1480.06 | 57.727 | 44.551 | 70.903 |
| 1480.54 | 57.913 | 45.359 | 70.467 |
| 1481.02 | 58.107 | 46.141 | 70.072 |
| 1481.5 | 58.313 | 46.969 | 69.657 |
| 1481.99 | 58.489 | 47.701 | 69.277 |
| 1482.47 | 58.7 | 48.497 | 68.903 |
| 1482.95 | 58.896 | 49.251 | 68.542 |
| 1483.44 | 59.091 | 49.961 | 68.22 |
| 1483.92 | 59.256 | 50.627 | 67.885 |
| 1484.41 | 59.464 | 51.36 | 67.568 |
| 1484.9 | 59.618 | 51.947 | 67.29 |
| 1485.39 | 59.779 | 52.564 | 66.994 |
| 1486.12 | 59.969 | 53.312 | 66.626 |
| 1486.61 | 60.081 | 53.805 | 66.356 |
| 1487.1 | 60.163 | 54.201 | 66.124 |
| 1487.59 | 60.256 | 54.598 | 65.915 |
| 1488.09 | 60.323 | 54.922 | 65.723 |
| 1488.58 | 60.359 | 55.162 | 65.557 |
| 1489.07 | 60.398 | 55.371 | 65.425 |
| 1489.57 | 60.39 | 55.507 | 65.273 |
| 1490.06 | 60.381 | 55.611 | 65.152 |
| 1490.56 | 60.344 | 55.623 | 65.065 |
| 1491.05 | 60.262 | 55.568 | 64.956 |
| 1491.55 | 60.195 | 55.49 | 64.901 |
| 1492.05 | 60.09 | 55.328 | 64.852 |
| 1492.54 | 59.963 | 55.103 | 64.823 |
| 1493.04 | 59.84 | 54.86 | 64.819 |
| 1493.54 | 59.685 | 54.528 | 64.843 |
| 1494.04 | 59.49 | 54.132 | 64.848 |
| 1494.54 | 59.309 | 53.72 | 64.899 |
| 1495.04 | 59.104 | 53.244 | 64.965 |
| 1495.54 | 58.895 | 52.77 | 65.02 |
| 1496.05 | 58.67 | 52.204 | 65.135 |
| 1496.55 | 58.414 | 51.601 | 65.228 |
| 1497.05 | 58.19 | 50.972 | 65.409 |
| 1497.56 | 57.933 | 50.343 | 65.523 |
| 1498.06 | 57.682 | 49.674 | 65.689 |
| 1498.56 | 57.43 | 48.969 | 65.892 |
| 1499.07 | 57.207 | 48.298 | 66.115 |
| 1499.57 | 56.934 | 47.573 | 66.295 |
| 1500.08 | 56.708 | 46.861 | 66.554 |
| 1500.59 | 56.48 | 46.137 | 66.822 |
| 1501.09 | 56.228 | 45.406 | 67.051 |
| 1501.6 | 56.001 | 44.651 | 67.35 |
| 1502.11 | 55.779 | 43.916 | 67.642 |
| 1502.61 | 55.549 | 43.16 | 67.938 |
| 1503.12 | 55.367 | 42.474 | 68.261 |
| 1503.63 | 55.176 | 41.732 | 68.619 |
| 1503.88 | 55.098 | 41.421 | 68.775 |
| 1504.39 | 54.944 | 40.727 | 69.162 |
| 1504.9 | 54.787 | 40.084 | 69.49 |
| 1505.41 | 54.646 | 39.399 | 69.893 |
| 1505.92 | 54.521 | 38.812 | 70.229 |
| 1506.43 | 54.413 | 38.151 | 70.675 |
| 1506.94 | 54.319 | 37.587 | 71.052 |
| 1507.45 | 54.244 | 36.993 | 71.494 |
| 1507.96 | 54.182 | 36.468 | 71.896 |
| 1508.47 | 54.129 | 35.921 | 72.338 |
| 1508.98 | 54.096 | 35.45 | 72.741 |
| 1509.49 | 54.067 | 34.917 | 73.216 |
| 1510.0 | 54.058 | 34.494 | 73.622 |
| 1510.51 | 54.065 | 34.045 | 74.086 |
| 1511.02 | 54.09 | 33.637 | 74.543 |
| 1511.54 | 54.1 | 33.218 | 74.982 |
| 1512.05 | 54.142 | 32.869 | 75.415 |
| 1512.56 | 54.163 | 32.52 | 75.807 |
| 1513.07 | 54.248 | 32.194 | 76.303 |
| 1513.58 | 54.309 | 31.878 | 76.74 |
| 1514.09 | 54.38 | 31.623 | 77.137 |
| 1514.6 | 54.465 | 31.346 | 77.583 |
| 1515.12 | 54.554 | 31.124 | 77.983 |
| 1515.63 | 54.651 | 30.895 | 78.407 |
| 1515.88 | 54.709 | 30.83 | 78.588 |
| 1516.39 | 54.821 | 30.641 | 79.001 |
| 1516.91 | 54.916 | 30.465 | 79.368 |
| 1517.42 | 55.043 | 30.358 | 79.727 |
| 1517.93 | 55.146 | 30.22 | 80.072 |
| 1518.44 | 55.255 | 30.118 | 80.393 |
| 1518.95 | 55.366 | 30.04 | 80.691 |
| 1519.46 | 55.489 | 29.98 | 80.998 |
| 1519.97 | 55.608 | 29.953 | 81.262 |
| 1520.48 | 55.727 | 29.913 | 81.54 |
| 1520.99 | 55.865 | 29.939 | 81.791 |
| 1521.5 | 55.961 | 29.948 | 81.975 |
| 1522.01 | 56.094 | 30.013 | 82.174 |
| 1522.52 | 56.205 | 30.084 | 82.326 |
| 1523.03 | 56.31 | 30.166 | 82.453 |
| 1523.54 | 56.416 | 30.263 | 82.569 |
| 1524.05 | 56.524 | 30.39 | 82.657 |
| 1524.56 | 56.643 | 30.533 | 82.753 |
| 1525.07 | 56.732 | 30.708 | 82.756 |
| 1525.57 | 56.851 | 30.896 | 82.807 |
| 1526.08 | 56.946 | 31.098 | 82.793 |
| 1526.59 | 57.035 | 31.325 | 82.745 |
| 1527.1 | 57.129 | 31.578 | 82.68 |
| 1527.6 | 57.226 | 31.843 | 82.609 |
| 1528.11 | 57.315 | 32.133 | 82.497 |
| 1528.61 | 57.396 | 32.438 | 82.354 |
| 1529.12 | 57.477 | 32.76 | 82.195 |
| 1529.62 | 57.565 | 33.112 | 82.017 |
| 1529.88 | 57.618 | 33.308 | 81.929 |
| 1530.38 | 57.695 | 33.652 | 81.738 |
| 1530.88 | 57.793 | 34.079 | 81.507 |
| 1531.39 | 57.877 | 34.509 | 81.245 |
| 1531.89 | 57.953 | 34.964 | 80.942 |
| 1532.39 | 58.059 | 35.402 | 80.716 |
| 1532.9 | 58.143 | 35.912 | 80.375 |
| 1533.4 | 58.24 | 36.401 | 80.079 |
| 1533.9 | 58.315 | 36.911 | 79.719 |
| 1534.4 | 58.419 | 37.445 | 79.393 |
| 1534.9 | 58.509 | 38.004 | 79.015 |
| 1535.4 | 58.617 | 38.55 | 78.683 |
| 1535.89 | 58.717 | 39.161 | 78.272 |
| 1536.39 | 58.822 | 39.732 | 77.912 |
| 1536.89 | 58.911 | 40.361 | 77.462 |
| 1537.39 | 59.038 | 40.97 | 77.106 |
| 1537.88 | 59.159 | 41.621 | 76.697 |
| 1538.38 | 59.254 | 42.211 | 76.298 |
| 1539.12 | 59.448 | 43.259 | 75.638 |
| 1539.61 | 59.57 | 43.908 | 75.232 |
| 1540.11 | 59.696 | 44.571 | 74.82 |
| 1540.6 | 59.817 | 45.226 | 74.408 |
| 1541.09 | 59.968 | 45.921 | 74.015 |
| 1541.58 | 60.092 | 46.567 | 73.616 |
| 1542.07 | 60.217 | 47.22 | 73.214 |
| 1542.56 | 60.308 | 47.816 | 72.799 |
| 1543.05 | 60.436 | 48.462 | 72.409 |
| 1543.54 | 60.535 | 49.057 | 72.013 |
| 1544.02 | 60.646 | 49.632 | 71.661 |
| 1544.51 | 60.746 | 50.211 | 71.282 |
| 1545.0 | 60.837 | 50.763 | 70.912 |
| 1545.48 | 60.93 | 51.3 | 70.56 |
| 1545.97 | 60.995 | 51.801 | 70.188 |
| 1546.45 | 61.085 | 52.286 | 69.884 |
| 1546.93 | 61.158 | 52.727 | 69.589 |
| 1547.41 | 61.214 | 53.14 | 69.289 |
| 1547.89 | 61.228 | 53.488 | 68.969 |
| 1548.61 | 61.24 | 53.977 | 68.503 |
| 1549.09 | 61.252 | 54.232 | 68.272 |
| 1549.57 | 61.245 | 54.481 | 68.009 |
| 1550.05 | 61.22 | 54.67 | 67.771 |
| 1550.52 | 61.157 | 54.805 | 67.509 |
| 1551.0 | 61.124 | 54.906 | 67.342 |
| 1551.47 | 61.055 | 54.976 | 67.133 |
| 1551.95 | 60.977 | 54.987 | 66.967 |
| 1552.42 | 60.891 | 55.007 | 66.775 |
| 1552.89 | 60.774 | 54.93 | 66.619 |
| 1553.6 | 60.586 | 54.761 | 66.41 |
| 1554.07 | 60.444 | 54.604 | 66.283 |
| 1554.53 | 60.286 | 54.395 | 66.178 |
| 1555.0 | 60.12 | 54.174 | 66.065 |
| 1555.47 | 59.95 | 53.914 | 65.986 |
| 1555.93 | 59.778 | 53.604 | 65.951 |
| 1556.4 | 59.563 | 53.266 | 65.86 |
| 1557.09 | 59.26 | 52.723 | 65.798 |
| 1557.56 | 59.089 | 52.394 | 65.784 |
| 1558.02 | 58.847 | 51.932 | 65.762 |
| 1558.48 | 58.639 | 51.51 | 65.768 |
| 1558.94 | 58.409 | 51.022 | 65.796 |
| 1559.4 | 58.188 | 50.57 | 65.807 |
| 1560.08 | 57.831 | 49.8 | 65.862 |
| 1560.54 | 57.605 | 49.282 | 65.928 |
| 1560.99 | 57.382 | 48.767 | 65.996 |
| 1561.45 | 57.155 | 48.246 | 66.064 |
| 1561.9 | 56.942 | 47.713 | 66.171 |
| 1562.58 | 56.605 | 46.896 | 66.313 |
| 1563.03 | 56.384 | 46.341 | 66.428 |
| 1563.48 | 56.171 | 45.798 | 66.545 |
| 1563.93 | 56 | 45.297 | 66.703 |
| 1564.6 | 55.698 | 44.461 | 66.936 |
| 1565.05 | 55.49 | 43.923 | 67.058 |
| 1565.49 | 55.322 | 43.404 | 67.239 |
| 1565.94 | 55.155 | 42.891 | 67.418 |
| 1566.6 | 54.92 | 42.131 | 67.709 |
| 1567.04 | 54.777 | 41.628 | 67.926 |
| 1567.49 | 54.653 | 41.163 | 68.142 |
| 1567.93 | 54.513 | 40.666 | 68.359 |
| 1568.58 | 54.299 | 39.92 | 68.679 |
| 1569.02 | 54.202 | 39.483 | 68.922 |
| 1569.46 | 54.092 | 39.045 | 69.139 |
| 1570.11 | 53.968 | 38.42 | 69.516 |
| 1570.55 | 53.9 | 37.989 | 69.811 |
| 1570.98 | 53.819 | 37.598 | 70.04 |
| 1571.41 | 53.737 | 37.19 | 70.283 |
| 1572.06 | 53.679 | 36.634 | 70.724 |
| 1572.49 | 53.649 | 36.267 | 71.031 |
| 1572.92 | 53.614 | 35.925 | 71.303 |
| 1573.56 | 53.569 | 35.439 | 71.699 |
| 1573.99 | 53.558 | 35.097 | 72.02 |
| 1574.42 | 53.551 | 34.807 | 72.295 |
| 1575.05 | 53.565 | 34.36 | 72.77 |
| 1575.48 | 53.573 | 34.057 | 73.089 |
| 1575.9 | 53.592 | 33.795 | 73.389 |
| 1576.54 | 53.631 | 33.415 | 73.847 |
| 1576.96 | 53.678 | 33.195 | 74.162 |
| 1577.59 | 53.756 | 32.847 | 74.664 |
| 1578.01 | 53.81 | 32.629 | 74.991 |
| 1578.42 | 53.853 | 32.43 | 75.276 |
| 1579.05 | 53.969 | 32.155 | 75.783 |
| 1579.47 | 54.06 | 32.002 | 76.118 |
| 1580.09 | 54.154 | 31.737 | 76.571 |
| 1580.5 | 54.237 | 31.596 | 76.877 |
| 1580.92 | 54.338 | 31.458 | 77.219 |
| 1581.53 | 54.461 | 31.268 | 77.654 |
| 1581.95 | 54.578 | 31.181 | 77.975 |
| 1582.56 | 54.733 | 31.043 | 78.424 |
| 1582.97 | 54.834 | 30.946 | 78.722 |
| 1583.58 | 54.994 | 30.851 | 79.137 |
| 1583.99 | 55.102 | 30.777 | 79.426 |
| 1584.6 | 55.274 | 30.735 | 79.813 |
| 1585.01 | 55.395 | 30.683 | 80.108 |
| 1585.41 | 55.497 | 30.649 | 80.345 |
| 1586.02 | 55.687 | 30.647 | 80.727 |
| 1586.42 | 55.802 | 30.645 | 80.959 |
| 1587.03 | 55.996 | 30.65 | 81.342 |
| 1587.43 | 56.122 | 30.689 | 81.554 |
| 1588.03 | 56.314 | 30.746 | 81.883 |
| 1588.43 | 56.438 | 30.804 | 82.072 |
| 1589.03 | 56.634 | 30.878 | 82.391 |
| 1589.43 | 56.747 | 30.946 | 82.549 |
| 1590.03 | 56.935 | 31.067 | 82.803 |
| 1590.43 | 57.068 | 31.173 | 82.962 |
| 1591.02 | 57.265 | 31.325 | 83.205 |
| 1591.42 | 57.361 | 31.442 | 83.281 |
| 1592.01 | 57.558 | 31.648 | 83.469 |
| 1592.41 | 57.662 | 31.781 | 83.543 |
| 1593.0 | 57.844 | 32.027 | 83.66 |
| 1593.59 | 58.035 | 32.286 | 83.784 |
| 1593.98 | 58.146 | 32.467 | 83.825 |
| 1594.57 | 58.326 | 32.752 | 83.9 |
| 1594.97 | 58.418 | 32.944 | 83.891 |
| 1595.56 | 58.594 | 33.281 | 83.907 |
| 1595.95 | 58.71 | 33.498 | 83.922 |
| 1596.53 | 58.87 | 33.861 | 83.88 |
| 1596.93 | 59 | 34.128 | 83.872 |
| 1597.51 | 59.134 | 34.508 | 83.76 |
| 1598.1 | 59.311 | 34.934 | 83.688 |
| 1598.49 | 59.418 | 35.242 | 83.594 |
| 1599.07 | 59.564 | 35.685 | 83.443 |
| 1599.46 | 59.652 | 35.985 | 83.319 |
| 1600.04 | 59.829 | 36.502 | 83.157 |
| 1600.43 | 59.944 | 36.833 | 83.056 |
| 1601.02 | 60.094 | 37.325 | 82.863 |
| 1601.6 | 60.239 | 37.899 | 82.578 |
| 1601.99 | 60.356 | 38.265 | 82.447 |
| 1602.57 | 60.491 | 38.798 | 82.184 |
| 1602.96 | 60.592 | 39.225 | 81.958 |
| 1603.54 | 60.714 | 39.779 | 81.649 |
| 1603.93 | 60.846 | 40.218 | 81.474 |
| 1604.51 | 60.991 | 40.853 | 81.128 |
| 1605.09 | 61.145 | 41.493 | 80.797 |
| 1605.48 | 61.239 | 41.914 | 80.563 |
| 1606.06 | 61.401 | 42.562 | 80.24 |
| 1606.45 | 61.49 | 43.015 | 79.965 |
| 1607.03 | 61.641 | 43.712 | 79.57 |
| 1607.42 | 61.758 | 44.154 | 79.362 |
| 1608.0 | 61.899 | 44.817 | 78.981 |
| 1608.58 | 62.044 | 45.516 | 78.572 |
| 1608.97 | 62.106 | 45.991 | 78.221 |
| 1609.56 | 62.272 | 46.665 | 77.879 |
| 1609.95 | 62.372 | 47.145 | 77.599 |
| 1610.53 | 62.524 | 47.83 | 77.219 |
| 1610.92 | 62.616 | 48.284 | 76.948 |
| 1611.51 | 62.738 | 48.96 | 76.517 |
| 1612.09 | 62.866 | 49.604 | 76.128 |
| 1612.48 | 62.926 | 50.045 | 75.806 |
| 1613.07 | 63.035 | 50.653 | 75.416 |
| 1613.46 | 63.101 | 51.053 | 75.149 |
| 1614.05 | 63.218 | 51.668 | 74.769 |
| 1614.44 | 63.28 | 52.06 | 74.5 |
| 1615.03 | 63.352 | 52.592 | 74.113 |
| 1615.42 | 63.406 | 52.929 | 73.882 |
| 1616.01 | 63.493 | 53.461 | 73.526 |
| 1616.41 | 63.498 | 53.765 | 73.231 |
| 1617.0 | 63.54 | 54.198 | 72.883 |
| 1617.6 | 63.55 | 54.581 | 72.519 |
| 1617.99 | 63.551 | 54.838 | 72.264 |
| 1618.59 | 63.541 | 55.163 | 71.92 |
| 1618.98 | 63.544 | 55.365 | 71.723 |
| 1619.58 | 63.474 | 55.57 | 71.378 |
| 1619.98 | 63.461 | 55.736 | 71.186 |
| 1620.58 | 63.382 | 55.869 | 70.895 |
| 1620.98 | 63.343 | 55.975 | 70.711 |
| 1621.58 | 63.22 | 56.026 | 70.413 |
| 1621.98 | 63.144 | 56.021 | 70.266 |
| 1622.59 | 62.994 | 56.017 | 69.97 |
| 1622.99 | 62.892 | 55.96 | 69.823 |
| 1623.6 | 62.712 | 55.828 | 69.596 |
| 1624.0 | 62.595 | 55.722 | 69.469 |
| 1624.41 | 62.465 | 55.617 | 69.314 |
| 1625.02 | 62.244 | 55.366 | 69.121 |
| 1625.42 | 62.103 | 55.197 | 69.008 |
| 1626.04 | 61.831 | 54.858 | 68.804 |
| 1626.45 | 61.7 | 54.631 | 68.769 |
| 1627.06 | 61.442 | 54.249 | 68.634 |
| 1627.47 | 61.252 | 53.952 | 68.553 |
| 1628.09 | 60.956 | 53.493 | 68.419 |
| 1628.5 | 60.762 | 53.166 | 68.358 |
| 1628.92 | 60.56 | 52.801 | 68.319 |
| 1629.54 | 60.282 | 52.287 | 68.277 |
| 1629.95 | 60.062 | 51.903 | 68.22 |
| 1630.58 | 59.753 | 51.308 | 68.199 |
| 1631.0 | 59.544 | 50.906 | 68.182 |
| 1631.41 | 59.317 | 50.46 | 68.174 |
| 1632.04 | 59.015 | 49.845 | 68.185 |
| 1632.46 | 58.829 | 49.447 | 68.211 |
| 1633.1 | 58.501 | 48.758 | 68.243 |
| 1633.52 | 58.311 | 48.331 | 68.291 |
| 1633.94 | 58.1 | 47.868 | 68.331 |
| 1634.58 | 57.811 | 47.204 | 68.418 |
| 1635.01 | 57.583 | 46.717 | 68.45 |
| 1635.43 | 57.403 | 46.272 | 68.534 |
| 1636.07 | 57.139 | 45.602 | 68.676 |
| 1636.5 | 56.95 | 45.124 | 68.776 |
| 1636.93 | 56.774 | 44.686 | 68.861 |
| 1637.58 | 56.503 | 43.981 | 69.025 |
| 1638.01 | 56.36 | 43.587 | 69.133 |
| 1638.44 | 56.164 | 43.091 | 69.238 |
| 1639.09 | 55.958 | 42.481 | 69.434 |
| 1639.53 | 55.826 | 42.059 | 69.592 |
| 1639.97 | 55.703 | 41.634 | 69.772 |
| 1640.4 | 55.568 | 41.206 | 69.931 |
| 1641.06 | 55.391 | 40.599 | 70.184 |
| 1641.5 | 55.295 | 40.227 | 70.362 |
| 1641.94 | 55.166 | 39.828 | 70.505 |
| 1642.6 | 55.04 | 39.254 | 70.825 |
| 1643.05 | 54.979 | 38.916 | 71.042 |
| 1643.49 | 54.897 | 38.534 | 71.261 |
| 1643.93 | 54.832 | 38.174 | 71.489 |
| 1644.6 | 54.742 | 37.684 | 71.8 |
| 1645.05 | 54.697 | 37.345 | 72.049 |
| 1645.5 | 54.651 | 37.005 | 72.297 |
| 1645.95 | 54.63 | 36.716 | 72.543 |
| 1646.4 | 54.621 | 36.414 | 72.828 |
| 1647.07 | 54.583 | 35.977 | 73.188 |
| 1647.52 | 54.58 | 35.71 | 73.451 |
| 1647.98 | 54.589 | 35.443 | 73.734 |
| 1648.43 | 54.598 | 35.204 | 73.992 |
| 1649.11 | 54.608 | 34.81 | 74.405 |
| 1649.57 | 54.634 | 34.606 | 74.663 |
| 1650.03 | 54.721 | 34.418 | 75.025 |